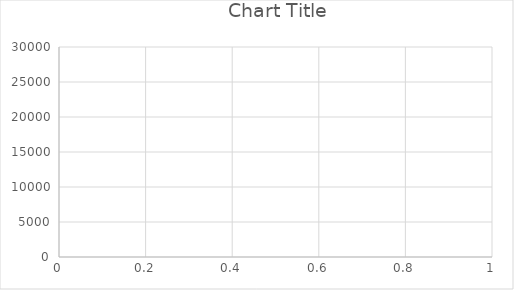
| Category | Series 0 |
|---|---|
| 0 | 7.311 |
| 1 | 4.989 |
| 2 | 3.975 |
| 3 | 108.128 |
| 4 | 89.555 |
| 5 | 74.954 |
| 6 | 64.622 |
| 7 | 58.103 |
| 8 | 440.562 |
| 9 | 396.65 |
| 10 | 360.752 |
| 11 | 330.891 |
| 12 | 305.546 |
| 13 | 283.875 |
| 14 | 272.303 |
| 15 | 255.418 |
| 16 | 240.505 |
| 17 | 228.195 |
| 18 | 223.236 |
| 19 | 212.188 |
| 20 | 203.521 |
| 21 | 194.389 |
| 22 | 185.996 |
| 23 | 178.289 |
| 24 | 177.979 |
| 25 | 171.371 |
| 26 | 165.078 |
| 27 | 159.52 |
| 28 | 154.261 |
| 29 | 149.266 |
| 30 | 144.552 |
| 31 | 154.583 |
| 32 | 149.931 |
| 33 | 145.576 |
| 34 | 141.526 |
| 35 | 137.635 |
| 36 | 134.292 |
| 37 | 130.86 |
| 38 | 130.37 |
| 39 | 127.332 |
| 40 | 124.267 |
| 41 | 121.337 |
| 42 | 118.684 |
| 43 | 121.255 |
| 44 | 118.795 |
| 45 | 116.708 |
| 46 | 114.247 |
| 47 | 112.064 |
| 48 | 109.801 |
| 49 | 107.712 |
| 50 | 105.642 |
| 51 | 103.631 |
| 52 | 101.716 |
| 53 | 99.902 |
| 54 | 98.112 |
| 55 | 96.504 |
| 56 | 94.835 |
| 57 | 93.311 |
| 58 | 91.882 |
| 59 | 90.407 |
| 60 | 88.973 |
| 61 | 87.57 |
| 62 | 86.514 |
| 63 | 85.178 |
| 64 | 83.9 |
| 65 | 82.671 |
| 66 | 81.509 |
| 67 | 80.355 |
| 68 | 79.24 |
| 69 | 78.16 |
| 70 | 77.084 |
| 71 | 76.052 |
| 72 | 75.665 |
| 73 | 74.677 |
| 74 | 74.039 |
| 75 | 73.282 |
| 76 | 72.404 |
| 77 | 71.525 |
| 78 | 70.782 |
| 79 | 69.95 |
| 80 | 69.116 |
| 81 | 68.288 |
| 82 | 67.657 |
| 83 | 66.867 |
| 84 | 66.232 |
| 85 | 65.553 |
| 86 | 64.831 |
| 87 | 64.128 |
| 88 | 63.641 |
| 89 | 63.099 |
| 90 | 62.477 |
| 91 | 62.039 |
| 92 | 61.47 |
| 93 | 60.86 |
| 94 | 65.11 |
| 95 | 64.551 |
| 96 | 64.017 |
| 97 | 66.038 |
| 98 | 65.385 |
| 99 | 64.775 |
| 100 | 64.151 |
| 101 | 63.592 |
| 102 | 63.093 |
| 103 | 62.522 |
| 104 | 62.035 |
| 105 | 61.498 |
| 106 | 61.001 |
| 107 | 61.023 |
| 108 | 60.498 |
| 109 | 60.057 |
| 110 | 59.588 |
| 111 | 59.081 |
| 112 | 58.639 |
| 113 | 58.15 |
| 114 | 57.655 |
| 115 | 57.257 |
| 116 | 56.78 |
| 117 | 57.996 |
| 118 | 57.586 |
| 119 | 57.149 |
| 120 | 56.688 |
| 121 | 56.235 |
| 122 | 55.788 |
| 123 | 85.157 |
| 124 | 84.54 |
| 125 | 84.016 |
| 126 | 83.398 |
| 127 | 82.939 |
| 128 | 82.44 |
| 129 | 81.852 |
| 130 | 81.401 |
| 131 | 80.81 |
| 132 | 80.247 |
| 133 | 84.47 |
| 134 | 149.108 |
| 135 | 148.024 |
| 136 | 146.952 |
| 137 | 145.9 |
| 138 | 144.995 |
| 139 | 143.971 |
| 140 | 142.957 |
| 141 | 142.41 |
| 142 | 141.428 |
| 143 | 140.487 |
| 144 | 139.742 |
| 145 | 138.896 |
| 146 | 137.995 |
| 147 | 137.073 |
| 148 | 136.167 |
| 149 | 135.267 |
| 150 | 153.898 |
| 151 | 152.893 |
| 152 | 151.901 |
| 153 | 150.921 |
| 154 | 150.011 |
| 155 | 149.064 |
| 156 | 148.127 |
| 157 | 147.201 |
| 158 | 146.306 |
| 159 | 145.416 |
| 160 | 144.519 |
| 161 | 143.725 |
| 162 | 144.482 |
| 163 | 143.624 |
| 164 | 146.421 |
| 165 | 148.007 |
| 166 | 1559.545 |
| 167 | 1550.277 |
| 168 | 1541.938 |
| 169 | 1533.062 |
| 170 | 1524.485 |
| 171 | 1515.633 |
| 172 | 1506.887 |
| 173 | 1499.493 |
| 174 | 1491.519 |
| 175 | 1483.113 |
| 176 | 1474.784 |
| 177 | 1467.159 |
| 178 | 1458.981 |
| 179 | 1450.938 |
| 180 | 1442.973 |
| 181 | 1435.05 |
| 182 | 1427.527 |
| 183 | 1419.792 |
| 184 | 1412.131 |
| 185 | 1404.618 |
| 186 | 1397.118 |
| 187 | 1389.692 |
| 188 | 1382.629 |
| 189 | 1375.357 |
| 190 | 1382.638 |
| 191 | 1375.492 |
| 192 | 1368.378 |
| 193 | 1361.331 |
| 194 | 1354.384 |
| 195 | 2205.536 |
| 196 | 2194.358 |
| 197 | 2183.314 |
| 198 | 2172.348 |
| 199 | 2161.493 |
| 200 | 2150.751 |
| 201 | 2142.897 |
| 202 | 2132.395 |
| 203 | 2121.947 |
| 204 | 2111.722 |
| 205 | 2101.488 |
| 206 | 2091.545 |
| 207 | 2084.589 |
| 208 | 2074.672 |
| 209 | 2064.893 |
| 210 | 2055.218 |
| 211 | 2045.926 |
| 212 | 2036.342 |
| 213 | 2026.907 |
| 214 | 2017.533 |
| 215 | 2008.219 |
| 216 | 1999.008 |
| 217 | 1989.865 |
| 218 | 1980.795 |
| 219 | 1971.88 |
| 220 | 1963.298 |
| 221 | 1954.461 |
| 222 | 1945.702 |
| 223 | 1937.046 |
| 224 | 1928.443 |
| 225 | 1919.968 |
| 226 | 1911.52 |
| 227 | 1903.145 |
| 228 | 1894.872 |
| 229 | 1886.639 |
| 230 | 1878.49 |
| 231 | 1870.473 |
| 232 | 1867.169 |
| 233 | 1859.204 |
| 234 | 1851.301 |
| 235 | 1843.462 |
| 236 | 1835.691 |
| 237 | 1827.984 |
| 238 | 1820.347 |
| 239 | 1812.78 |
| 240 | 1806.167 |
| 241 | 1798.715 |
| 242 | 1791.319 |
| 243 | 1788.265 |
| 244 | 1780.985 |
| 245 | 1773.749 |
| 246 | 1766.593 |
| 247 | 1759.48 |
| 248 | 1752.42 |
| 249 | 1745.507 |
| 250 | 1738.563 |
| 251 | 1732.445 |
| 252 | 1725.605 |
| 253 | 1718.864 |
| 254 | 1712.128 |
| 255 | 1705.444 |
| 256 | 1698.823 |
| 257 | 1692.242 |
| 258 | 1685.768 |
| 259 | 1679.323 |
| 260 | 1672.913 |
| 261 | 1666.534 |
| 262 | 1660.224 |
| 263 | 1654.006 |
| 264 | 1647.805 |
| 265 | 1641.62 |
| 266 | 1635.477 |
| 267 | 1629.38 |
| 268 | 1623.364 |
| 269 | 1617.359 |
| 270 | 1611.451 |
| 271 | 1606.916 |
| 272 | 1601.036 |
| 273 | 1595.209 |
| 274 | 1589.415 |
| 275 | 1583.883 |
| 276 | 1578.17 |
| 277 | 1572.498 |
| 278 | 1566.866 |
| 279 | 1561.977 |
| 280 | 1556.44 |
| 281 | 1550.926 |
| 282 | 1545.657 |
| 283 | 1540.219 |
| 284 | 1534.901 |
| 285 | 1529.587 |
| 286 | 1524.275 |
| 287 | 1518.987 |
| 288 | 1513.931 |
| 289 | 1508.73 |
| 290 | 1503.733 |
| 291 | 1498.593 |
| 292 | 1508.387 |
| 293 | 1503.337 |
| 294 | 1498.281 |
| 295 | 1493.54 |
| 296 | 1488.517 |
| 297 | 1483.86 |
| 298 | 1478.901 |
| 299 | 1473.977 |
| 300 | 1469.086 |
| 301 | 1466.045 |
| 302 | 1461.211 |
| 303 | 1456.426 |
| 304 | 1451.66 |
| 305 | 1446.921 |
| 306 | 1442.257 |
| 307 | 1437.586 |
| 308 | 1432.938 |
| 309 | 1428.32 |
| 310 | 1423.743 |
| 311 | 1419.183 |
| 312 | 1415.598 |
| 313 | 1411.094 |
| 314 | 1406.617 |
| 315 | 1402.224 |
| 316 | 1397.806 |
| 317 | 1394.397 |
| 318 | 1390.178 |
| 319 | 1385.838 |
| 320 | 1390.386 |
| 321 | 1386.092 |
| 322 | 1381.83 |
| 323 | 1377.57 |
| 324 | 1373.335 |
| 325 | 1369.172 |
| 326 | 1364.992 |
| 327 | 1360.833 |
| 328 | 1356.705 |
| 329 | 1352.6 |
| 330 | 1348.527 |
| 331 | 1344.468 |
| 332 | 1340.438 |
| 333 | 1337.719 |
| 334 | 1333.736 |
| 335 | 1329.771 |
| 336 | 1325.877 |
| 337 | 1321.962 |
| 338 | 1318.076 |
| 339 | 1314.217 |
| 340 | 1310.366 |
| 341 | 1306.542 |
| 342 | 1302.818 |
| 343 | 1299.035 |
| 344 | 1295.274 |
| 345 | 1291.535 |
| 346 | 1288.082 |
| 347 | 1284.413 |
| 348 | 1280.777 |
| 349 | 1277.503 |
| 350 | 1273.868 |
| 351 | 1270.304 |
| 352 | 1266.712 |
| 353 | 1263.144 |
| 354 | 1259.601 |
| 355 | 1256.073 |
| 356 | 1252.56 |
| 357 | 1249.099 |
| 358 | 1245.624 |
| 359 | 1242.203 |
| 360 | 1238.789 |
| 361 | 1235.483 |
| 362 | 1232.085 |
| 363 | 1228.705 |
| 364 | 1225.916 |
| 365 | 1222.664 |
| 366 | 1219.341 |
| 367 | 1216.059 |
| 368 | 1212.851 |
| 369 | 1209.593 |
| 370 | 1206.593 |
| 371 | 1203.355 |
| 372 | 1200.189 |
| 373 | 1197.078 |
| 374 | 1193.932 |
| 375 | 1190.76 |
| 376 | 1187.612 |
| 377 | 1184.489 |
| 378 | 1181.368 |
| 379 | 1178.262 |
| 380 | 1183.628 |
| 381 | 1180.677 |
| 382 | 1179.042 |
| 383 | 1175.996 |
| 384 | 1172.944 |
| 385 | 1169.912 |
| 386 | 1166.891 |
| 387 | 1163.984 |
| 388 | 1161.02 |
| 389 | 1158.049 |
| 390 | 1155.094 |
| 391 | 1152.193 |
| 392 | 1149.279 |
| 393 | 1146.366 |
| 394 | 1143.471 |
| 395 | 1140.587 |
| 396 | 1137.82 |
| 397 | 1134.969 |
| 398 | 1132.131 |
| 399 | 1129.398 |
| 400 | 1126.621 |
| 401 | 1123.822 |
| 402 | 1121.037 |
| 403 | 1118.277 |
| 404 | 1115.582 |
| 405 | 1112.848 |
| 406 | 1110.153 |
| 407 | 1109.232 |
| 408 | 1106.526 |
| 409 | 1103.83 |
| 410 | 1101.153 |
| 411 | 1098.576 |
| 412 | 1095.919 |
| 413 | 1093.454 |
| 414 | 1092.799 |
| 415 | 1090.176 |
| 416 | 1087.579 |
| 417 | 1084.981 |
| 418 | 1082.394 |
| 419 | 1079.844 |
| 420 | 1081.651 |
| 421 | 1079.119 |
| 422 | 1081.679 |
| 423 | 1079.32 |
| 424 | 1077.117 |
| 425 | 1074.608 |
| 426 | 1072.115 |
| 427 | 1069.617 |
| 428 | 1067.135 |
| 429 | 1064.658 |
| 430 | 1062.197 |
| 431 | 1059.771 |
| 432 | 1057.328 |
| 433 | 1054.895 |
| 434 | 1052.475 |
| 435 | 1050.067 |
| 436 | 1049.783 |
| 437 | 1047.39 |
| 438 | 1045.008 |
| 439 | 1042.637 |
| 440 | 1040.278 |
| 441 | 1037.929 |
| 442 | 1035.59 |
| 443 | 1033.353 |
| 444 | 1031.061 |
| 445 | 1029.022 |
| 446 | 1032.24 |
| 447 | 1032.161 |
| 448 | 1029.873 |
| 449 | 1027.588 |
| 450 | 1025.314 |
| 451 | 1023.048 |
| 452 | 1020.816 |
| 453 | 1018.573 |
| 454 | 1016.346 |
| 455 | 1014.129 |
| 456 | 1011.913 |
| 457 | 1009.748 |
| 458 | 1008.018 |
| 459 | 1005.83 |
| 460 | 1003.654 |
| 461 | 1001.556 |
| 462 | 999.403 |
| 463 | 997.306 |
| 464 | 995.164 |
| 465 | 993.034 |
| 466 | 990.91 |
| 467 | 988.807 |
| 468 | 986.702 |
| 469 | 984.607 |
| 470 | 982.798 |
| 471 | 980.746 |
| 472 | 978.703 |
| 473 | 977.045 |
| 474 | 975.023 |
| 475 | 972.977 |
| 476 | 970.96 |
| 477 | 968.934 |
| 478 | 966.94 |
| 479 | 964.936 |
| 480 | 962.933 |
| 481 | 960.957 |
| 482 | 958.971 |
| 483 | 962.669 |
| 484 | 960.688 |
| 485 | 958.73 |
| 486 | 956.853 |
| 487 | 954.896 |
| 488 | 952.959 |
| 489 | 951.05 |
| 490 | 949.301 |
| 491 | 947.387 |
| 492 | 945.489 |
| 493 | 943.579 |
| 494 | 941.68 |
| 495 | 939.794 |
| 496 | 937.908 |
| 497 | 936.028 |
| 498 | 934.52 |
| 499 | 935.283 |
| 500 | 933.42 |
| 501 | 931.578 |
| 502 | 930.356 |
| 503 | 929.032 |
| 504 | 927.212 |
| 505 | 925.384 |
| 506 | 923.768 |
| 507 | 921.952 |
| 508 | 920.199 |
| 509 | 918.579 |
| 510 | 916.784 |
| 511 | 915.157 |
| 512 | 913.383 |
| 513 | 911.636 |
| 514 | 909.9 |
| 515 | 908.139 |
| 516 | 906.409 |
| 517 | 904.814 |
| 518 | 931.233 |
| 519 | 929.77 |
| 520 | 927.989 |
| 521 | 926.214 |
| 522 | 924.449 |
| 523 | 922.766 |
| 524 | 921.01 |
| 525 | 919.263 |
| 526 | 920.787 |
| 527 | 919.045 |
| 528 | 917.354 |
| 529 | 917.157 |
| 530 | 915.447 |
| 531 | 913.728 |
| 532 | 912.016 |
| 533 | 910.794 |
| 534 | 909.12 |
| 535 | 907.521 |
| 536 | 905.837 |
| 537 | 904.2 |
| 538 | 902.583 |
| 539 | 900.924 |
| 540 | 899.262 |
| 541 | 897.627 |
| 542 | 904.418 |
| 543 | 902.763 |
| 544 | 901.109 |
| 545 | 899.46 |
| 546 | 897.869 |
| 547 | 896.236 |
| 548 | 894.605 |
| 549 | 893.008 |
| 550 | 891.391 |
| 551 | 889.778 |
| 552 | 888.173 |
| 553 | 886.586 |
| 554 | 885.003 |
| 555 | 883.414 |
| 556 | 881.834 |
| 557 | 880.971 |
| 558 | 880.063 |
| 559 | 878.497 |
| 560 | 876.938 |
| 561 | 875.381 |
| 562 | 873.852 |
| 563 | 872.325 |
| 564 | 870.855 |
| 565 | 869.54 |
| 566 | 868.199 |
| 567 | 866.674 |
| 568 | 865.153 |
| 569 | 863.64 |
| 570 | 862.179 |
| 571 | 860.674 |
| 572 | 859.176 |
| 573 | 857.696 |
| 574 | 856.301 |
| 575 | 854.927 |
| 576 | 853.449 |
| 577 | 851.996 |
| 578 | 850.533 |
| 579 | 849.07 |
| 580 | 847.613 |
| 581 | 846.16 |
| 582 | 844.711 |
| 583 | 843.267 |
| 584 | 841.83 |
| 585 | 840.727 |
| 586 | 839.305 |
| 587 | 837.896 |
| 588 | 836.479 |
| 589 | 835.067 |
| 590 | 833.656 |
| 591 | 832.252 |
| 592 | 830.851 |
| 593 | 829.545 |
| 594 | 828.158 |
| 595 | 826.772 |
| 596 | 825.39 |
| 597 | 824.046 |
| 598 | 822.673 |
| 599 | 821.318 |
| 600 | 819.955 |
| 601 | 818.614 |
| 602 | 817.288 |
| 603 | 815.937 |
| 604 | 814.611 |
| 605 | 813.293 |
| 606 | 811.959 |
| 607 | 810.637 |
| 608 | 809.33 |
| 609 | 808.005 |
| 610 | 806.686 |
| 611 | 805.371 |
| 612 | 804.06 |
| 613 | 802.753 |
| 614 | 801.623 |
| 615 | 800.337 |
| 616 | 799.042 |
| 617 | 797.756 |
| 618 | 796.471 |
| 619 | 795.191 |
| 620 | 793.912 |
| 621 | 792.669 |
| 622 | 791.399 |
| 623 | 790.132 |
| 624 | 788.872 |
| 625 | 787.79 |
| 626 | 786.704 |
| 627 | 785.468 |
| 628 | 784.255 |
| 629 | 783.013 |
| 630 | 790.086 |
| 631 | 788.853 |
| 632 | 787.628 |
| 633 | 786.388 |
| 634 | 785.168 |
| 635 | 783.936 |
| 636 | 782.711 |
| 637 | 781.784 |
| 638 | 780.563 |
| 639 | 779.347 |
| 640 | 778.187 |
| 641 | 776.977 |
| 642 | 775.772 |
| 643 | 774.58 |
| 644 | 773.485 |
| 645 | 772.293 |
| 646 | 771.1 |
| 647 | 769.959 |
| 648 | 768.834 |
| 649 | 767.674 |
| 650 | 766.538 |
| 651 | 765.467 |
| 652 | 764.299 |
| 653 | 763.133 |
| 654 | 761.971 |
| 655 | 760.812 |
| 656 | 759.666 |
| 657 | 758.518 |
| 658 | 757.369 |
| 659 | 756.225 |
| 660 | 755.083 |
| 661 | 753.944 |
| 662 | 752.814 |
| 663 | 751.683 |
| 664 | 750.556 |
| 665 | 749.515 |
| 666 | 748.396 |
| 667 | 747.284 |
| 668 | 747.916 |
| 669 | 746.804 |
| 670 | 745.743 |
| 671 | 745.38 |
| 672 | 744.297 |
| 673 | 743.199 |
| 674 | 742.105 |
| 675 | 741.012 |
| 676 | 739.921 |
| 677 | 738.883 |
| 678 | 737.803 |
| 679 | 736.76 |
| 680 | 735.685 |
| 681 | 734.612 |
| 682 | 733.538 |
| 683 | 732.47 |
| 684 | 731.403 |
| 685 | 730.34 |
| 686 | 729.293 |
| 687 | 728.249 |
| 688 | 727.196 |
| 689 | 726.144 |
| 690 | 725.119 |
| 691 | 724.074 |
| 692 | 726.978 |
| 693 | 725.933 |
| 694 | 724.89 |
| 695 | 723.852 |
| 696 | 723.095 |
| 697 | 722.067 |
| 698 | 721.144 |
| 699 | 720.116 |
| 700 | 719.808 |
| 701 | 718.784 |
| 702 | 717.778 |
| 703 | 716.768 |
| 704 | 715.753 |
| 705 | 714.793 |
| 706 | 713.785 |
| 707 | 712.779 |
| 708 | 711.779 |
| 709 | 711.31 |
| 710 | 710.319 |
| 711 | 709.323 |
| 712 | 708.533 |
| 713 | 707.604 |
| 714 | 706.617 |
| 715 | 705.633 |
| 716 | 704.665 |
| 717 | 703.706 |
| 718 | 702.73 |
| 719 | 701.756 |
| 720 | 700.785 |
| 721 | 699.827 |
| 722 | 698.875 |
| 723 | 697.911 |
| 724 | 696.951 |
| 725 | 695.996 |
| 726 | 695.04 |
| 727 | 694.092 |
| 728 | 693.146 |
| 729 | 693.347 |
| 730 | 692.402 |
| 731 | 691.722 |
| 732 | 691.376 |
| 733 | 690.437 |
| 734 | 689.514 |
| 735 | 688.579 |
| 736 | 687.884 |
| 737 | 686.968 |
| 738 | 686.04 |
| 739 | 685.116 |
| 740 | 684.197 |
| 741 | 683.282 |
| 742 | 682.364 |
| 743 | 681.573 |
| 744 | 680.68 |
| 745 | 679.871 |
| 746 | 678.962 |
| 747 | 678.062 |
| 748 | 677.182 |
| 749 | 676.628 |
| 750 | 675.729 |
| 751 | 674.834 |
| 752 | 675.054 |
| 753 | 676.037 |
| 754 | 675.144 |
| 755 | 675.156 |
| 756 | 674.265 |
| 757 | 673.381 |
| 758 | 682.667 |
| 759 | 681.776 |
| 760 | 680.882 |
| 761 | 679.992 |
| 762 | 679.106 |
| 763 | 678.69 |
| 764 | 677.805 |
| 765 | 676.922 |
| 766 | 676.041 |
| 767 | 675.167 |
| 768 | 674.291 |
| 769 | 673.472 |
| 770 | 672.603 |
| 771 | 672.966 |
| 772 | 672.1 |
| 773 | 671.234 |
| 774 | 670.875 |
| 775 | 670.013 |
| 776 | 669.16 |
| 777 | 668.306 |
| 778 | 667.452 |
| 779 | 666.623 |
| 780 | 665.771 |
| 781 | 664.924 |
| 782 | 664.077 |
| 783 | 663.235 |
| 784 | 662.403 |
| 785 | 661.566 |
| 786 | 660.728 |
| 787 | 659.891 |
| 788 | 659.058 |
| 789 | 658.24 |
| 790 | 657.41 |
| 791 | 656.587 |
| 792 | 655.771 |
| 793 | 654.947 |
| 794 | 654.138 |
| 795 | 653.364 |
| 796 | 652.715 |
| 797 | 651.914 |
| 798 | 651.12 |
| 799 | 650.309 |
| 800 | 649.503 |
| 801 | 648.711 |
| 802 | 647.905 |
| 803 | 647.102 |
| 804 | 646.304 |
| 805 | 645.504 |
| 806 | 644.706 |
| 807 | 643.91 |
| 808 | 643.118 |
| 809 | 642.332 |
| 810 | 641.664 |
| 811 | 640.916 |
| 812 | 645.853 |
| 813 | 645.062 |
| 814 | 644.274 |
| 815 | 643.489 |
| 816 | 642.719 |
| 817 | 642.024 |
| 818 | 641.246 |
| 819 | 640.472 |
| 820 | 639.709 |
| 821 | 638.934 |
| 822 | 638.171 |
| 823 | 637.398 |
| 824 | 636.64 |
| 825 | 635.873 |
| 826 | 635.106 |
| 827 | 634.342 |
| 828 | 633.685 |
| 829 | 632.932 |
| 830 | 632.172 |
| 831 | 631.416 |
| 832 | 630.688 |
| 833 | 629.934 |
| 834 | 629.182 |
| 835 | 628.431 |
| 836 | 627.686 |
| 837 | 626.939 |
| 838 | 626.195 |
| 839 | 625.451 |
| 840 | 624.713 |
| 841 | 623.976 |
| 842 | 623.281 |
| 843 | 622.55 |
| 844 | 621.815 |
| 845 | 621.082 |
| 846 | 620.356 |
| 847 | 619.654 |
| 848 | 618.926 |
| 849 | 618.2 |
| 850 | 617.483 |
| 851 | 616.761 |
| 852 | 616.039 |
| 853 | 615.321 |
| 854 | 614.602 |
| 855 | 613.886 |
| 856 | 613.181 |
| 857 | 612.468 |
| 858 | 611.805 |
| 859 | 611.099 |
| 860 | 610.417 |
| 861 | 609.711 |
| 862 | 609.006 |
| 863 | 608.303 |
| 864 | 607.604 |
| 865 | 606.947 |
| 866 | 606.249 |
| 867 | 605.556 |
| 868 | 604.863 |
| 869 | 604.17 |
| 870 | 603.48 |
| 871 | 602.889 |
| 872 | 602.204 |
| 873 | 601.58 |
| 874 | 600.899 |
| 875 | 600.215 |
| 876 | 599.536 |
| 877 | 598.858 |
| 878 | 598.21 |
| 879 | 597.535 |
| 880 | 596.864 |
| 881 | 596.189 |
| 882 | 595.516 |
| 883 | 594.845 |
| 884 | 594.186 |
| 885 | 594.338 |
| 886 | 593.669 |
| 887 | 593.002 |
| 888 | 592.337 |
| 889 | 591.684 |
| 890 | 591.023 |
| 891 | 590.372 |
| 892 | 589.715 |
| 893 | 609.168 |
| 894 | 608.49 |
| 895 | 607.82 |
| 896 | 607.263 |
| 897 | 606.59 |
| 898 | 605.925 |
| 899 | 605.268 |
| 900 | 604.626 |
| 901 | 603.957 |
| 902 | 603.289 |
| 903 | 602.624 |
| 904 | 601.962 |
| 905 | 601.301 |
| 906 | 600.723 |
| 907 | 600.068 |
| 908 | 599.409 |
| 909 | 598.752 |
| 910 | 598.155 |
| 911 | 597.513 |
| 912 | 596.86 |
| 913 | 596.209 |
| 914 | 595.56 |
| 915 | 594.911 |
| 916 | 594.264 |
| 917 | 593.618 |
| 918 | 592.974 |
| 919 | 592.375 |
| 920 | 591.733 |
| 921 | 591.092 |
| 922 | 590.46 |
| 923 | 589.823 |
| 924 | 589.317 |
| 925 | 598.728 |
| 926 | 598.12 |
| 927 | 597.507 |
| 928 | 596.865 |
| 929 | 596.229 |
| 930 | 595.59 |
| 931 | 594.953 |
| 932 | 596.397 |
| 933 | 595.762 |
| 934 | 595.128 |
| 935 | 594.493 |
| 936 | 593.884 |
| 937 | 593.255 |
| 938 | 592.625 |
| 939 | 596.105 |
| 940 | 595.685 |
| 941 | 595.056 |
| 942 | 594.432 |
| 943 | 593.805 |
| 944 | 593.181 |
| 945 | 592.557 |
| 946 | 591.932 |
| 947 | 591.309 |
| 948 | 590.975 |
| 949 | 590.357 |
| 950 | 589.742 |
| 951 | 589.13 |
| 952 | 588.516 |
| 953 | 587.902 |
| 954 | 587.288 |
| 955 | 586.683 |
| 956 | 586.071 |
| 957 | 585.547 |
| 958 | 584.942 |
| 959 | 584.335 |
| 960 | 583.731 |
| 961 | 583.133 |
| 962 | 582.529 |
| 963 | 581.927 |
| 964 | 581.325 |
| 965 | 580.726 |
| 966 | 580.133 |
| 967 | 579.768 |
| 968 | 579.172 |
| 969 | 578.646 |
| 970 | 578.119 |
| 971 | 577.538 |
| 972 | 576.946 |
| 973 | 576.39 |
| 974 | 575.8 |
| 975 | 575.213 |
| 976 | 574.629 |
| 977 | 574.043 |
| 978 | 573.462 |
| 979 | 572.878 |
| 980 | 572.299 |
| 981 | 571.72 |
| 982 | 571.169 |
| 983 | 570.591 |
| 984 | 570.016 |
| 985 | 569.441 |
| 986 | 568.875 |
| 987 | 568.304 |
| 988 | 567.734 |
| 989 | 567.164 |
| 990 | 566.593 |
| 991 | 566.025 |
| 992 | 565.462 |
| 993 | 564.902 |
| 994 | 564.336 |
| 995 | 563.771 |
| 996 | 563.213 |
| 997 | 562.661 |
| 998 | 562.099 |
| 999 | 561.54 |
| 1000 | 560.98 |
| 1001 | 560.422 |
| 1002 | 559.864 |
| 1003 | 559.31 |
| 1004 | 558.784 |
| 1005 | 558.23 |
| 1006 | 557.679 |
| 1007 | 557.127 |
| 1008 | 556.576 |
| 1009 | 556.026 |
| 1010 | 555.478 |
| 1011 | 554.942 |
| 1012 | 554.407 |
| 1013 | 553.92 |
| 1014 | 553.383 |
| 1015 | 552.842 |
| 1016 | 552.305 |
| 1017 | 551.984 |
| 1018 | 551.446 |
| 1019 | 551.409 |
| 1020 | 550.871 |
| 1021 | 550.34 |
| 1022 | 549.804 |
| 1023 | 549.272 |
| 1024 | 548.742 |
| 1025 | 548.305 |
| 1026 | 547.81 |
| 1027 | 547.279 |
| 1028 | 546.777 |
| 1029 | 546.252 |
| 1030 | 545.724 |
| 1031 | 545.196 |
| 1032 | 544.67 |
| 1033 | 544.145 |
| 1034 | 543.621 |
| 1035 | 543.098 |
| 1036 | 543.078 |
| 1037 | 542.558 |
| 1038 | 542.037 |
| 1039 | 541.608 |
| 1040 | 541.092 |
| 1041 | 540.582 |
| 1042 | 540.065 |
| 1043 | 539.554 |
| 1044 | 539.041 |
| 1045 | 538.532 |
| 1046 | 544.351 |
| 1047 | 543.834 |
| 1048 | 543.333 |
| 1049 | 542.828 |
| 1050 | 542.313 |
| 1051 | 541.798 |
| 1052 | 541.285 |
| 1053 | 540.788 |
| 1054 | 540.311 |
| 1055 | 539.802 |
| 1056 | 539.292 |
| 1057 | 538.784 |
| 1058 | 538.276 |
| 1059 | 537.77 |
| 1060 | 537.266 |
| 1061 | 536.762 |
| 1062 | 536.262 |
| 1063 | 535.762 |
| 1064 | 535.321 |
| 1065 | 534.821 |
| 1066 | 534.337 |
| 1067 | 533.843 |
| 1068 | 533.345 |
| 1069 | 532.855 |
| 1070 | 532.359 |
| 1071 | 531.865 |
| 1072 | 531.373 |
| 1073 | 530.914 |
| 1074 | 530.421 |
| 1075 | 529.93 |
| 1076 | 529.47 |
| 1077 | 528.981 |
| 1078 | 528.502 |
| 1079 | 528.014 |
| 1080 | 527.528 |
| 1081 | 527.042 |
| 1082 | 526.646 |
| 1083 | 526.175 |
| 1084 | 525.691 |
| 1085 | 525.208 |
| 1086 | 524.728 |
| 1087 | 524.247 |
| 1088 | 523.768 |
| 1089 | 523.292 |
| 1090 | 522.813 |
| 1091 | 522.614 |
| 1092 | 522.137 |
| 1093 | 521.661 |
| 1094 | 521.189 |
| 1095 | 520.715 |
| 1096 | 520.242 |
| 1097 | 519.781 |
| 1098 | 519.316 |
| 1099 | 518.855 |
| 1100 | 518.386 |
| 1101 | 517.931 |
| 1102 | 517.465 |
| 1103 | 520.003 |
| 1104 | 519.533 |
| 1105 | 519.065 |
| 1106 | 518.6 |
| 1107 | 518.179 |
| 1108 | 518.433 |
| 1109 | 517.969 |
| 1110 | 517.505 |
| 1111 | 517.05 |
| 1112 | 516.601 |
| 1113 | 516.306 |
| 1114 | 515.93 |
| 1115 | 515.474 |
| 1116 | 515.016 |
| 1117 | 514.557 |
| 1118 | 514.106 |
| 1119 | 513.648 |
| 1120 | 513.192 |
| 1121 | 512.736 |
| 1122 | 512.28 |
| 1123 | 511.86 |
| 1124 | 511.407 |
| 1125 | 510.955 |
| 1126 | 510.502 |
| 1127 | 510.051 |
| 1128 | 509.6 |
| 1129 | 509.152 |
| 1130 | 508.704 |
| 1131 | 508.257 |
| 1132 | 507.836 |
| 1133 | 507.391 |
| 1134 | 506.947 |
| 1135 | 506.504 |
| 1136 | 506.062 |
| 1137 | 505.618 |
| 1138 | 505.175 |
| 1139 | 504.828 |
| 1140 | 504.402 |
| 1141 | 503.97 |
| 1142 | 503.53 |
| 1143 | 503.098 |
| 1144 | 502.664 |
| 1145 | 502.23 |
| 1146 | 501.799 |
| 1147 | 501.793 |
| 1148 | 501.358 |
| 1149 | 500.923 |
| 1150 | 500.489 |
| 1151 | 500.114 |
| 1152 | 499.682 |
| 1153 | 499.271 |
| 1154 | 498.841 |
| 1155 | 498.411 |
| 1156 | 497.991 |
| 1157 | 497.562 |
| 1158 | 497.217 |
| 1159 | 496.794 |
| 1160 | 496.367 |
| 1161 | 495.941 |
| 1162 | 495.517 |
| 1163 | 495.092 |
| 1164 | 494.688 |
| 1165 | 494.265 |
| 1166 | 493.843 |
| 1167 | 493.426 |
| 1168 | 493.095 |
| 1169 | 492.675 |
| 1170 | 492.255 |
| 1171 | 492.034 |
| 1172 | 491.629 |
| 1173 | 491.211 |
| 1174 | 490.8 |
| 1175 | 490.392 |
| 1176 | 489.977 |
| 1177 | 489.563 |
| 1178 | 489.149 |
| 1179 | 488.742 |
| 1180 | 488.33 |
| 1181 | 487.92 |
| 1182 | 487.509 |
| 1183 | 487.103 |
| 1184 | 486.694 |
| 1185 | 486.286 |
| 1186 | 485.901 |
| 1187 | 485.493 |
| 1188 | 485.087 |
| 1189 | 484.693 |
| 1190 | 484.306 |
| 1191 | 483.902 |
| 1192 | 483.5 |
| 1193 | 483.108 |
| 1194 | 482.886 |
| 1195 | 482.689 |
| 1196 | 482.29 |
| 1197 | 481.892 |
| 1198 | 481.493 |
| 1199 | 481.094 |
| 1200 | 480.699 |
| 1201 | 480.3 |
| 1202 | 479.903 |
| 1203 | 479.505 |
| 1204 | 479.139 |
| 1205 | 478.743 |
| 1206 | 478.347 |
| 1207 | 477.954 |
| 1208 | 477.56 |
| 1209 | 477.173 |
| 1210 | 476.812 |
| 1211 | 476.42 |
| 1212 | 476.032 |
| 1213 | 475.652 |
| 1214 | 475.265 |
| 1215 | 474.881 |
| 1216 | 474.494 |
| 1217 | 474.106 |
| 1218 | 473.718 |
| 1219 | 473.332 |
| 1220 | 472.946 |
| 1221 | 474.72 |
| 1222 | 474.352 |
| 1223 | 1415.337 |
| 1224 | 1414.183 |
| 1225 | 1413.038 |
| 1226 | 1411.888 |
| 1227 | 1410.744 |
| 1228 | 1409.599 |
| 1229 | 1408.455 |
| 1230 | 1407.313 |
| 1231 | 1406.202 |
| 1232 | 1405.066 |
| 1233 | 1403.929 |
| 1234 | 1402.793 |
| 1235 | 1401.806 |
| 1236 | 1420.737 |
| 1237 | 1419.59 |
| 1238 | 1418.448 |
| 1239 | 1417.31 |
| 1240 | 1416.181 |
| 1241 | 1415.051 |
| 1242 | 1413.914 |
| 1243 | 1412.778 |
| 1244 | 1411.839 |
| 1245 | 1410.708 |
| 1246 | 1409.577 |
| 1247 | 1408.523 |
| 1248 | 1407.396 |
| 1249 | 1406.347 |
| 1250 | 1405.769 |
| 1251 | 1404.649 |
| 1252 | 1403.545 |
| 1253 | 1402.427 |
| 1254 | 1401.314 |
| 1255 | 1400.199 |
| 1256 | 1399.086 |
| 1257 | 1397.988 |
| 1258 | 1396.879 |
| 1259 | 1395.772 |
| 1260 | 1394.666 |
| 1261 | 1393.6 |
| 1262 | 1392.578 |
| 1263 | 1391.478 |
| 1264 | 1390.381 |
| 1265 | 1389.284 |
| 1266 | 1388.189 |
| 1267 | 1387.11 |
| 1268 | 1386.025 |
| 1269 | 1384.941 |
| 1270 | 1383.855 |
| 1271 | 1382.79 |
| 1272 | 1381.705 |
| 1273 | 1381.253 |
| 1274 | 1380.173 |
| 1275 | 1379.094 |
| 1276 | 1378.021 |
| 1277 | 1376.95 |
| 1278 | 1375.874 |
| 1279 | 1374.822 |
| 1280 | 1374.08 |
| 1281 | 1373.014 |
| 1282 | 1371.962 |
| 1283 | 1370.894 |
| 1284 | 1369.829 |
| 1285 | 1368.771 |
| 1286 | 1367.709 |
| 1287 | 1366.655 |
| 1288 | 1365.598 |
| 1289 | 1364.55 |
| 1290 | 1363.52 |
| 1291 | 1362.468 |
| 1292 | 1361.416 |
| 1293 | 1360.856 |
| 1294 | 1359.823 |
| 1295 | 1358.776 |
| 1296 | 1357.729 |
| 1297 | 1356.685 |
| 1298 | 1355.642 |
| 1299 | 1354.602 |
| 1300 | 1353.562 |
| 1301 | 1352.538 |
| 1302 | 1351.502 |
| 1303 | 1352.602 |
| 1304 | 1351.567 |
| 1305 | 1350.536 |
| 1306 | 1349.504 |
| 1307 | 1348.477 |
| 1308 | 1347.452 |
| 1309 | 1346.425 |
| 1310 | 1345.527 |
| 1311 | 1344.503 |
| 1312 | 1725.766 |
| 1313 | 1724.454 |
| 1314 | 1723.146 |
| 1315 | 1721.837 |
| 1316 | 1720.54 |
| 1317 | 1719.236 |
| 1318 | 1717.945 |
| 1319 | 1716.646 |
| 1320 | 1715.349 |
| 1321 | 1714.053 |
| 1322 | 1712.759 |
| 1323 | 1711.474 |
| 1324 | 1710.193 |
| 1325 | 1708.904 |
| 1326 | 1707.618 |
| 1327 | 1706.334 |
| 1328 | 1705.052 |
| 1329 | 1703.777 |
| 1330 | 1702.498 |
| 1331 | 1701.222 |
| 1332 | 1699.948 |
| 1333 | 1698.677 |
| 1334 | 1697.43 |
| 1335 | 1696.205 |
| 1336 | 1694.939 |
| 1337 | 1693.679 |
| 1338 | 1692.433 |
| 1339 | 1691.171 |
| 1340 | 1689.93 |
| 1341 | 1688.676 |
| 1342 | 1687.422 |
| 1343 | 1686.169 |
| 1344 | 1684.992 |
| 1345 | 1683.741 |
| 1346 | 1682.495 |
| 1347 | 1681.249 |
| 1348 | 1680.004 |
| 1349 | 1678.816 |
| 1350 | 1677.575 |
| 1351 | 1676.34 |
| 1352 | 1680.598 |
| 1353 | 1679.36 |
| 1354 | 1678.122 |
| 1355 | 1676.885 |
| 1356 | 1675.652 |
| 1357 | 1674.419 |
| 1358 | 1673.217 |
| 1359 | 1671.99 |
| 1360 | 1670.8 |
| 1361 | 1669.576 |
| 1362 | 1668.373 |
| 1363 | 1667.151 |
| 1364 | 1665.934 |
| 1365 | 1664.737 |
| 1366 | 1663.52 |
| 1367 | 1662.308 |
| 1368 | 1661.095 |
| 1369 | 1659.887 |
| 1370 | 1658.812 |
| 1371 | 1657.605 |
| 1372 | 1656.4 |
| 1373 | 1655.195 |
| 1374 | 1653.993 |
| 1375 | 1652.792 |
| 1376 | 1651.598 |
| 1377 | 1650.401 |
| 1378 | 1649.206 |
| 1379 | 1648.012 |
| 1380 | 1650.969 |
| 1381 | 1649.776 |
| 1382 | 1648.586 |
| 1383 | 1647.413 |
| 1384 | 1646.233 |
| 1385 | 1645.05 |
| 1386 | 1643.93 |
| 1387 | 1656.276 |
| 1388 | 1655.084 |
| 1389 | 1653.895 |
| 1390 | 1652.709 |
| 1391 | 1651.522 |
| 1392 | 1650.344 |
| 1393 | 1649.161 |
| 1394 | 1647.98 |
| 1395 | 1730.133 |
| 1396 | 1728.895 |
| 1397 | 1727.659 |
| 1398 | 1726.425 |
| 1399 | 1725.193 |
| 1400 | 1723.963 |
| 1401 | 1722.735 |
| 1402 | 1721.511 |
| 1403 | 1720.286 |
| 1404 | 1719.07 |
| 1405 | 1717.848 |
| 1406 | 1716.629 |
| 1407 | 1715.418 |
| 1408 | 1714.202 |
| 1409 | 1713.183 |
| 1410 | 1713.364 |
| 1411 | 1712.263 |
| 1412 | 1711.052 |
| 1413 | 1709.856 |
| 1414 | 1708.65 |
| 1415 | 1707.447 |
| 1416 | 1706.303 |
| 1417 | 1705.101 |
| 1418 | 1703.901 |
| 1419 | 1702.703 |
| 1420 | 1701.519 |
| 1421 | 1700.393 |
| 1422 | 1699.206 |
| 1423 | 1698.015 |
| 1424 | 1696.825 |
| 1425 | 1695.636 |
| 1426 | 1694.456 |
| 1427 | 1693.274 |
| 1428 | 1692.091 |
| 1429 | 1690.92 |
| 1430 | 1689.742 |
| 1431 | 1688.563 |
| 1432 | 1687.386 |
| 1433 | 1686.217 |
| 1434 | 1685.045 |
| 1435 | 1683.873 |
| 1436 | 1682.702 |
| 1437 | 1681.533 |
| 1438 | 1680.392 |
| 1439 | 1679.23 |
| 1440 | 1678.068 |
| 1441 | 1676.905 |
| 1442 | 1675.757 |
| 1443 | 1674.711 |
| 1444 | 1673.553 |
| 1445 | 1672.397 |
| 1446 | 1671.242 |
| 1447 | 1671.038 |
| 1448 | 1669.886 |
| 1449 | 1668.74 |
| 1450 | 1667.599 |
| 1451 | 1666.452 |
| 1452 | 1665.308 |
| 1453 | 1664.217 |
| 1454 | 1663.074 |
| 1455 | 1661.933 |
| 1456 | 1660.793 |
| 1457 | 1659.663 |
| 1458 | 1658.531 |
| 1459 | 1657.424 |
| 1460 | 1656.292 |
| 1461 | 1655.161 |
| 1462 | 1654.064 |
| 1463 | 1652.939 |
| 1464 | 1651.812 |
| 1465 | 1650.753 |
| 1466 | 1649.628 |
| 1467 | 1648.517 |
| 1468 | 1647.397 |
| 1469 | 1646.293 |
| 1470 | 1645.175 |
| 1471 | 1644.066 |
| 1472 | 1642.951 |
| 1473 | 1641.837 |
| 1474 | 1640.739 |
| 1475 | 1639.629 |
| 1476 | 1638.904 |
| 1477 | 1637.796 |
| 1478 | 1636.7 |
| 1479 | 1635.597 |
| 1480 | 1634.494 |
| 1481 | 1633.393 |
| 1482 | 1632.327 |
| 1483 | 1631.231 |
| 1484 | 1630.134 |
| 1485 | 1629.038 |
| 1486 | 1627.952 |
| 1487 | 1627.005 |
| 1488 | 1625.914 |
| 1489 | 1624.826 |
| 1490 | 1623.738 |
| 1491 | 1622.667 |
| 1492 | 1621.581 |
| 1493 | 1620.497 |
| 1494 | 1620.926 |
| 1495 | 1619.903 |
| 1496 | 1618.823 |
| 1497 | 1617.743 |
| 1498 | 1616.666 |
| 1499 | 1615.59 |
| 1500 | 1614.516 |
| 1501 | 1613.441 |
| 1502 | 1612.369 |
| 1503 | 1611.297 |
| 1504 | 1610.227 |
| 1505 | 1609.161 |
| 1506 | 1608.096 |
| 1507 | 1607.033 |
| 1508 | 1605.971 |
| 1509 | 1604.909 |
| 1510 | 1603.848 |
| 1511 | 1603.066 |
| 1512 | 1602.116 |
| 1513 | 1601.065 |
| 1514 | 1600.067 |
| 1515 | 1599.014 |
| 1516 | 1597.977 |
| 1517 | 1596.929 |
| 1518 | 1596.734 |
| 1519 | 1595.687 |
| 1520 | 1594.639 |
| 1521 | 1593.592 |
| 1522 | 1592.549 |
| 1523 | 1591.508 |
| 1524 | 1590.465 |
| 1525 | 1590.685 |
| 1526 | 1589.645 |
| 1527 | 1588.605 |
| 1528 | 1587.572 |
| 1529 | 1586.536 |
| 1530 | 1585.508 |
| 1531 | 1585.008 |
| 1532 | 1584.03 |
| 1533 | 1582.998 |
| 1534 | 1581.968 |
| 1535 | 1580.939 |
| 1536 | 1579.913 |
| 1537 | 1578.886 |
| 1538 | 1577.862 |
| 1539 | 1576.838 |
| 1540 | 1575.824 |
| 1541 | 1574.805 |
| 1542 | 1573.785 |
| 1543 | 1572.947 |
| 1544 | 1571.93 |
| 1545 | 1570.915 |
| 1546 | 1569.9 |
| 1547 | 1568.887 |
| 1548 | 1567.876 |
| 1549 | 1566.868 |
| 1550 | 1565.858 |
| 1551 | 1564.85 |
| 1552 | 1563.845 |
| 1553 | 1562.855 |
| 1554 | 1561.852 |
| 1555 | 1560.869 |
| 1556 | 1560.385 |
| 1557 | 1559.385 |
| 1558 | 1558.387 |
| 1559 | 1557.389 |
| 1560 | 1556.392 |
| 1561 | 1555.402 |
| 1562 | 1554.419 |
| 1563 | 1553.427 |
| 1564 | 1552.436 |
| 1565 | 1551.469 |
| 1566 | 1550.481 |
| 1567 | 1549.536 |
| 1568 | 1548.565 |
| 1569 | 1547.647 |
| 1570 | 1546.668 |
| 1571 | 1546.782 |
| 1572 | 1545.799 |
| 1573 | 1544.933 |
| 1574 | 1543.953 |
| 1575 | 1544.059 |
| 1576 | 1543.081 |
| 1577 | 1542.732 |
| 1578 | 1541.767 |
| 1579 | 1540.794 |
| 1580 | 1539.837 |
| 1581 | 1538.865 |
| 1582 | 1537.894 |
| 1583 | 1536.924 |
| 1584 | 1535.961 |
| 1585 | 1535.032 |
| 1586 | 1534.071 |
| 1587 | 1533.106 |
| 1588 | 1532.142 |
| 1589 | 1531.18 |
| 1590 | 1530.265 |
| 1591 | 1529.304 |
| 1592 | 1528.351 |
| 1593 | 1527.406 |
| 1594 | 1526.454 |
| 1595 | 1525.499 |
| 1596 | 1524.545 |
| 1597 | 1523.594 |
| 1598 | 1522.642 |
| 1599 | 1521.718 |
| 1600 | 1520.768 |
| 1601 | 1519.819 |
| 1602 | 1518.873 |
| 1603 | 1517.927 |
| 1604 | 1516.985 |
| 1605 | 1516.045 |
| 1606 | 1515.109 |
| 1607 | 1514.839 |
| 1608 | 1513.904 |
| 1609 | 1512.983 |
| 1610 | 1512.045 |
| 1611 | 1511.108 |
| 1612 | 1510.173 |
| 1613 | 1509.242 |
| 1614 | 1508.313 |
| 1615 | 1507.384 |
| 1616 | 1506.459 |
| 1617 | 1505.53 |
| 1618 | 1504.602 |
| 1619 | 1503.674 |
| 1620 | 1502.747 |
| 1621 | 1501.822 |
| 1622 | 1500.898 |
| 1623 | 1499.974 |
| 1624 | 1499.054 |
| 1625 | 1498.143 |
| 1626 | 1497.223 |
| 1627 | 1496.305 |
| 1628 | 1495.387 |
| 1629 | 1494.471 |
| 1630 | 1493.556 |
| 1631 | 1492.667 |
| 1632 | 1491.755 |
| 1633 | 1490.85 |
| 1634 | 1489.939 |
| 1635 | 1489.029 |
| 1636 | 1488.122 |
| 1637 | 1487.216 |
| 1638 | 1486.31 |
| 1639 | 1485.405 |
| 1640 | 1484.502 |
| 1641 | 1483.599 |
| 1642 | 1482.699 |
| 1643 | 1481.802 |
| 1644 | 1480.902 |
| 1645 | 1480.004 |
| 1646 | 1479.106 |
| 1647 | 1478.21 |
| 1648 | 1477.331 |
| 1649 | 1476.58 |
| 1650 | 1475.687 |
| 1651 | 1474.816 |
| 1652 | 1473.926 |
| 1653 | 1473.038 |
| 1654 | 1472.148 |
| 1655 | 1471.264 |
| 1656 | 1470.398 |
| 1657 | 1469.641 |
| 1658 | 1468.837 |
| 1659 | 1467.953 |
| 1660 | 1467.124 |
| 1661 | 1466.242 |
| 1662 | 1465.362 |
| 1663 | 1464.485 |
| 1664 | 1463.611 |
| 1665 | 1462.743 |
| 1666 | 1461.866 |
| 1667 | 1460.991 |
| 1668 | 1460.116 |
| 1669 | 1459.389 |
| 1670 | 1458.519 |
| 1671 | 1457.653 |
| 1672 | 1456.783 |
| 1673 | 1455.934 |
| 1674 | 1455.068 |
| 1675 | 1454.201 |
| 1676 | 1453.351 |
| 1677 | 1452.487 |
| 1678 | 1451.623 |
| 1679 | 1450.761 |
| 1680 | 1449.906 |
| 1681 | 1449.047 |
| 1682 | 1448.399 |
| 1683 | 1550.887 |
| 1684 | 1549.967 |
| 1685 | 1549.164 |
| 1686 | 1548.409 |
| 1687 | 1547.496 |
| 1688 | 1546.58 |
| 1689 | 1545.668 |
| 1690 | 1544.756 |
| 1691 | 1543.846 |
| 1692 | 1542.935 |
| 1693 | 1542.03 |
| 1694 | 1541.132 |
| 1695 | 1540.224 |
| 1696 | 1539.317 |
| 1697 | 1538.417 |
| 1698 | 1537.513 |
| 1699 | 1536.615 |
| 1700 | 1535.712 |
| 1701 | 1534.813 |
| 1702 | 1533.913 |
| 1703 | 1533.014 |
| 1704 | 1532.116 |
| 1705 | 1531.22 |
| 1706 | 1530.329 |
| 1707 | 1529.445 |
| 1708 | 1528.982 |
| 1709 | 1528.09 |
| 1710 | 1527.217 |
| 1711 | 1526.333 |
| 1712 | 1525.45 |
| 1713 | 1524.574 |
| 1714 | 1523.686 |
| 1715 | 1522.799 |
| 1716 | 1521.913 |
| 1717 | 1521.032 |
| 1718 | 1520.167 |
| 1719 | 1519.287 |
| 1720 | 1518.405 |
| 1721 | 1517.524 |
| 1722 | 1516.644 |
| 1723 | 1516.537 |
| 1724 | 1515.658 |
| 1725 | 1514.781 |
| 1726 | 1513.904 |
| 1727 | 1513.03 |
| 1728 | 1512.155 |
| 1729 | 1511.282 |
| 1730 | 1510.411 |
| 1731 | 1509.571 |
| 1732 | 1508.783 |
| 1733 | 1507.914 |
| 1734 | 1507.046 |
| 1735 | 1506.18 |
| 1736 | 1505.315 |
| 1737 | 1504.453 |
| 1738 | 1503.589 |
| 1739 | 1502.725 |
| 1740 | 1501.873 |
| 1741 | 1501.012 |
| 1742 | 1502.145 |
| 1743 | 1501.286 |
| 1744 | 1500.448 |
| 1745 | 1499.59 |
| 1746 | 1498.734 |
| 1747 | 1497.878 |
| 1748 | 1497.123 |
| 1749 | 1496.268 |
| 1750 | 1495.415 |
| 1751 | 1494.673 |
| 1752 | 1493.824 |
| 1753 | 1492.984 |
| 1754 | 1492.134 |
| 1755 | 1491.595 |
| 1756 | 1490.747 |
| 1757 | 1489.91 |
| 1758 | 1489.064 |
| 1759 | 1488.219 |
| 1760 | 1487.375 |
| 1761 | 1489.905 |
| 1762 | 1489.123 |
| 1763 | 1488.28 |
| 1764 | 1487.441 |
| 1765 | 1486.602 |
| 1766 | 1485.762 |
| 1767 | 1484.925 |
| 1768 | 1484.089 |
| 1769 | 1483.253 |
| 1770 | 1482.418 |
| 1771 | 1481.659 |
| 1772 | 1480.835 |
| 1773 | 1480.001 |
| 1774 | 1479.175 |
| 1775 | 1478.343 |
| 1776 | 1477.516 |
| 1777 | 1476.686 |
| 1778 | 1475.859 |
| 1779 | 1475.233 |
| 1780 | 1474.413 |
| 1781 | 1473.595 |
| 1782 | 1472.769 |
| 1783 | 1471.946 |
| 1784 | 1471.314 |
| 1785 | 1470.497 |
| 1786 | 1469.691 |
| 1787 | 1468.874 |
| 1788 | 1468.054 |
| 1789 | 1467.24 |
| 1790 | 1466.422 |
| 1791 | 1465.61 |
| 1792 | 1464.793 |
| 1793 | 1463.978 |
| 1794 | 1463.201 |
| 1795 | 1462.398 |
| 1796 | 1461.598 |
| 1797 | 1460.786 |
| 1798 | 1459.975 |
| 1799 | 1459.169 |
| 1800 | 1458.36 |
| 1801 | 1457.551 |
| 1802 | 1456.756 |
| 1803 | 1456.13 |
| 1804 | 1455.348 |
| 1805 | 1454.55 |
| 1806 | 1453.747 |
| 1807 | 1452.944 |
| 1808 | 1452.146 |
| 1809 | 1451.346 |
| 1810 | 1450.56 |
| 1811 | 1449.765 |
| 1812 | 1448.971 |
| 1813 | 1448.189 |
| 1814 | 1447.393 |
| 1815 | 1446.603 |
| 1816 | 1445.808 |
| 1817 | 1445.013 |
| 1818 | 1444.228 |
| 1819 | 1443.438 |
| 1820 | 1445.962 |
| 1821 | 1445.17 |
| 1822 | 1444.383 |
| 1823 | 1443.592 |
| 1824 | 1442.802 |
| 1825 | 1442.032 |
| 1826 | 1441.244 |
| 1827 | 1440.46 |
| 1828 | 1439.673 |
| 1829 | 1438.887 |
| 1830 | 1438.103 |
| 1831 | 1437.319 |
| 1832 | 1436.538 |
| 1833 | 1435.756 |
| 1834 | 1435.011 |
| 1835 | 1434.232 |
| 1836 | 1433.452 |
| 1837 | 1432.676 |
| 1838 | 1431.898 |
| 1839 | 1431.128 |
| 1840 | 1430.989 |
| 1841 | 1430.285 |
| 1842 | 1429.511 |
| 1843 | 1428.736 |
| 1844 | 1428.003 |
| 1845 | 1427.324 |
| 1846 | 1426.558 |
| 1847 | 1425.787 |
| 1848 | 1425.019 |
| 1849 | 1424.25 |
| 1850 | 1423.504 |
| 1851 | 1422.745 |
| 1852 | 1422.118 |
| 1853 | 1421.352 |
| 1854 | 1420.594 |
| 1855 | 1419.83 |
| 1856 | 1419.103 |
| 1857 | 1418.48 |
| 1858 | 1417.719 |
| 1859 | 1416.957 |
| 1860 | 1416.197 |
| 1861 | 1415.438 |
| 1862 | 1414.681 |
| 1863 | 1413.934 |
| 1864 | 1413.223 |
| 1865 | 1412.468 |
| 1866 | 1411.712 |
| 1867 | 1410.957 |
| 1868 | 1410.208 |
| 1869 | 1409.454 |
| 1870 | 1408.702 |
| 1871 | 1407.952 |
| 1872 | 1407.214 |
| 1873 | 1406.467 |
| 1874 | 1405.718 |
| 1875 | 1404.969 |
| 1876 | 1404.248 |
| 1877 | 1403.503 |
| 1878 | 1402.792 |
| 1879 | 1402.046 |
| 1880 | 1401.312 |
| 1881 | 1400.575 |
| 1882 | 1399.832 |
| 1883 | 1399.094 |
| 1884 | 1398.354 |
| 1885 | 1397.613 |
| 1886 | 1396.879 |
| 1887 | 1396.14 |
| 1888 | 1395.407 |
| 1889 | 1394.699 |
| 1890 | 1393.962 |
| 1891 | 1393.23 |
| 1892 | 1392.586 |
| 1893 | 1391.853 |
| 1894 | 1391.121 |
| 1895 | 1390.392 |
| 1896 | 1389.666 |
| 1897 | 1388.937 |
| 1898 | 1388.21 |
| 1899 | 1387.481 |
| 1900 | 1386.752 |
| 1901 | 1386.024 |
| 1902 | 1385.296 |
| 1903 | 1384.569 |
| 1904 | 1383.949 |
| 1905 | 1383.224 |
| 1906 | 1382.5 |
| 1907 | 1381.848 |
| 1908 | 1381.125 |
| 1909 | 1380.403 |
| 1910 | 1380.078 |
| 1911 | 1379.357 |
| 1912 | 1378.637 |
| 1913 | 1377.917 |
| 1914 | 1377.2 |
| 1915 | 1376.483 |
| 1916 | 1375.767 |
| 1917 | 1375.051 |
| 1918 | 1374.351 |
| 1919 | 1373.636 |
| 1920 | 1372.927 |
| 1921 | 1372.215 |
| 1922 | 1371.502 |
| 1923 | 1370.791 |
| 1924 | 1370.092 |
| 1925 | 1369.382 |
| 1926 | 1368.674 |
| 1927 | 1367.965 |
| 1928 | 1367.358 |
| 1929 | 1366.651 |
| 1930 | 1365.944 |
| 1931 | 1365.238 |
| 1932 | 1364.534 |
| 1933 | 1364.333 |
| 1934 | 1363.629 |
| 1935 | 1362.958 |
| 1936 | 1362.26 |
| 1937 | 1361.561 |
| 1938 | 1360.874 |
| 1939 | 1360.185 |
| 1940 | 1359.485 |
| 1941 | 1358.791 |
| 1942 | 1358.093 |
| 1943 | 1357.395 |
| 1944 | 1356.701 |
| 1945 | 1356.005 |
| 1946 | 1355.31 |
| 1947 | 1354.615 |
| 1948 | 1353.929 |
| 1949 | 1353.236 |
| 1950 | 1363.247 |
| 1951 | 1362.549 |
| 1952 | 1361.965 |
| 1953 | 1363.428 |
| 1954 | 1362.732 |
| 1955 | 1362.036 |
| 1956 | 1361.341 |
| 1957 | 1360.647 |
| 1958 | 1359.953 |
| 1959 | 1359.26 |
| 1960 | 1358.589 |
| 1961 | 1357.897 |
| 1962 | 1357.211 |
| 1963 | 1356.521 |
| 1964 | 1355.831 |
| 1965 | 1355.213 |
| 1966 | 1354.526 |
| 1967 | 1353.874 |
| 1968 | 1353.229 |
| 1969 | 1352.543 |
| 1970 | 1351.858 |
| 1971 | 1351.183 |
| 1972 | 1350.524 |
| 1973 | 1349.841 |
| 1974 | 1349.162 |
| 1975 | 1348.481 |
| 1976 | 1347.799 |
| 1977 | 1347.121 |
| 1978 | 1346.448 |
| 1979 | 1345.769 |
| 1980 | 1345.095 |
| 1981 | 1344.418 |
| 1982 | 1343.742 |
| 1983 | 1343.065 |
| 1984 | 1342.389 |
| 1985 | 1342.839 |
| 1986 | 1343.125 |
| 1987 | 1342.45 |
| 1988 | 1341.779 |
| 1989 | 1341.106 |
| 1990 | 1340.438 |
| 1991 | 1339.819 |
| 1992 | 1339.154 |
| 1993 | 1338.483 |
| 1994 | 1337.813 |
| 1995 | 1337.145 |
| 1996 | 1336.476 |
| 1997 | 1335.808 |
| 1998 | 1335.14 |
| 1999 | 1334.614 |
| 2000 | 1333.948 |
| 2001 | 1333.283 |
| 2002 | 1332.619 |
| 2003 | 1331.955 |
| 2004 | 1331.312 |
| 2005 | 1330.65 |
| 2006 | 1329.988 |
| 2007 | 1329.326 |
| 2008 | 1328.668 |
| 2009 | 1328.011 |
| 2010 | 1327.352 |
| 2011 | 1326.943 |
| 2012 | 1326.297 |
| 2013 | 1325.645 |
| 2014 | 1325.029 |
| 2015 | 1324.373 |
| 2016 | 1323.717 |
| 2017 | 1323.197 |
| 2018 | 1322.562 |
| 2019 | 1321.91 |
| 2020 | 1321.488 |
| 2021 | 1320.835 |
| 2022 | 1320.184 |
| 2023 | 1319.533 |
| 2024 | 1327.321 |
| 2025 | 1327.493 |
| 2026 | 1326.838 |
| 2027 | 1326.187 |
| 2028 | 1325.534 |
| 2029 | 1324.883 |
| 2030 | 1324.912 |
| 2031 | 1877.853 |
| 2032 | 1876.936 |
| 2033 | 1876.015 |
| 2034 | 1875.094 |
| 2035 | 1874.174 |
| 2036 | 1873.278 |
| 2037 | 1872.377 |
| 2038 | 1871.462 |
| 2039 | 1870.545 |
| 2040 | 1869.63 |
| 2041 | 1869.059 |
| 2042 | 1868.193 |
| 2043 | 1867.31 |
| 2044 | 1866.4 |
| 2045 | 1865.494 |
| 2046 | 1864.584 |
| 2047 | 1863.763 |
| 2048 | 1862.856 |
| 2049 | 1861.949 |
| 2050 | 1861.043 |
| 2051 | 1860.138 |
| 2052 | 1859.39 |
| 2053 | 1858.492 |
| 2054 | 1857.599 |
| 2055 | 1856.696 |
| 2056 | 1855.794 |
| 2057 | 1854.941 |
| 2058 | 1854.041 |
| 2059 | 1853.143 |
| 2060 | 1852.244 |
| 2061 | 1851.349 |
| 2062 | 1850.455 |
| 2063 | 1849.559 |
| 2064 | 1848.665 |
| 2065 | 1847.771 |
| 2066 | 1846.881 |
| 2067 | 1845.992 |
| 2068 | 1845.101 |
| 2069 | 1844.213 |
| 2070 | 1843.323 |
| 2071 | 1842.435 |
| 2072 | 1841.6 |
| 2073 | 1840.713 |
| 2074 | 1839.83 |
| 2075 | 1839.154 |
| 2076 | 1838.28 |
| 2077 | 1837.396 |
| 2078 | 1836.513 |
| 2079 | 1835.631 |
| 2080 | 1834.75 |
| 2081 | 1833.874 |
| 2082 | 1832.995 |
| 2083 | 1832.12 |
| 2084 | 1831.244 |
| 2085 | 1830.367 |
| 2086 | 1829.491 |
| 2087 | 1828.616 |
| 2088 | 1827.741 |
| 2089 | 1826.91 |
| 2090 | 1826.037 |
| 2091 | 1825.165 |
| 2092 | 1824.294 |
| 2093 | 1823.426 |
| 2094 | 1822.58 |
| 2095 | 1822.168 |
| 2096 | 1821.3 |
| 2097 | 1820.433 |
| 2098 | 1819.566 |
| 2099 | 1818.72 |
| 2100 | 1817.964 |
| 2101 | 1817.1 |
| 2102 | 1816.24 |
| 2103 | 1815.377 |
| 2104 | 1814.515 |
| 2105 | 1813.655 |
| 2106 | 1812.795 |
| 2107 | 1811.939 |
| 2108 | 1811.08 |
| 2109 | 1810.223 |
| 2110 | 1809.367 |
| 2111 | 1808.511 |
| 2112 | 1807.656 |
| 2113 | 1807.011 |
| 2114 | 1806.157 |
| 2115 | 1805.307 |
| 2116 | 1804.479 |
| 2117 | 1803.628 |
| 2118 | 1802.783 |
| 2119 | 1801.934 |
| 2120 | 1801.085 |
| 2121 | 1800.237 |
| 2122 | 1799.391 |
| 2123 | 1798.595 |
| 2124 | 1922.807 |
| 2125 | 1921.906 |
| 2126 | 1921.015 |
| 2127 | 1920.116 |
| 2128 | 1919.215 |
| 2129 | 1918.315 |
| 2130 | 1917.424 |
| 2131 | 1916.526 |
| 2132 | 1915.653 |
| 2133 | 1914.756 |
| 2134 | 1913.86 |
| 2135 | 1912.964 |
| 2136 | 1912.092 |
| 2137 | 1911.199 |
| 2138 | 1910.306 |
| 2139 | 1921.116 |
| 2140 | 1920.229 |
| 2141 | 1919.655 |
| 2142 | 1918.763 |
| 2143 | 1917.873 |
| 2144 | 1916.982 |
| 2145 | 1916.102 |
| 2146 | 1915.21 |
| 2147 | 1914.379 |
| 2148 | 1913.505 |
| 2149 | 1912.617 |
| 2150 | 1911.758 |
| 2151 | 1910.87 |
| 2152 | 1909.984 |
| 2153 | 1909.098 |
| 2154 | 1908.213 |
| 2155 | 1907.329 |
| 2156 | 1906.446 |
| 2157 | 1905.566 |
| 2158 | 1904.684 |
| 2159 | 1903.803 |
| 2160 | 1902.964 |
| 2161 | 1902.087 |
| 2162 | 1901.209 |
| 2163 | 1900.343 |
| 2164 | 1901.836 |
| 2165 | 1900.961 |
| 2166 | 1900.087 |
| 2167 | 1899.212 |
| 2168 | 1898.339 |
| 2169 | 1897.504 |
| 2170 | 1896.631 |
| 2171 | 1895.765 |
| 2172 | 1894.896 |
| 2173 | 1894.028 |
| 2174 | 1893.158 |
| 2175 | 1892.289 |
| 2176 | 1891.421 |
| 2177 | 1890.553 |
| 2178 | 1889.69 |
| 2179 | 1893.195 |
| 2180 | 1892.334 |
| 2181 | 1891.469 |
| 2182 | 1890.603 |
| 2183 | 1889.754 |
| 2184 | 1889.028 |
| 2185 | 1888.166 |
| 2186 | 1887.303 |
| 2187 | 1886.441 |
| 2188 | 1885.581 |
| 2189 | 1884.767 |
| 2190 | 1893.66 |
| 2191 | 1892.809 |
| 2192 | 1891.949 |
| 2193 | 1891.709 |
| 2194 | 1890.85 |
| 2195 | 1889.991 |
| 2196 | 1889.131 |
| 2197 | 1888.273 |
| 2198 | 1887.471 |
| 2199 | 1886.614 |
| 2200 | 1885.758 |
| 2201 | 1884.902 |
| 2202 | 1884.049 |
| 2203 | 1883.252 |
| 2204 | 1896.312 |
| 2205 | 1895.454 |
| 2206 | 1894.76 |
| 2207 | 1893.902 |
| 2208 | 1893.104 |
| 2209 | 1892.248 |
| 2210 | 1891.394 |
| 2211 | 1890.541 |
| 2212 | 1889.692 |
| 2213 | 1888.842 |
| 2214 | 1887.991 |
| 2215 | 1887.141 |
| 2216 | 1886.981 |
| 2217 | 1886.133 |
| 2218 | 1885.3 |
| 2219 | 1884.451 |
| 2220 | 1883.604 |
| 2221 | 1882.786 |
| 2222 | 1881.939 |
| 2223 | 1881.094 |
| 2224 | 1880.266 |
| 2225 | 1879.43 |
| 2226 | 1878.589 |
| 2227 | 1877.747 |
| 2228 | 1876.906 |
| 2229 | 1876.067 |
| 2230 | 1875.232 |
| 2231 | 1874.393 |
| 2232 | 1873.554 |
| 2233 | 1872.717 |
| 2234 | 1871.879 |
| 2235 | 1871.054 |
| 2236 | 1870.218 |
| 2237 | 1870.829 |
| 2238 | 1870.022 |
| 2239 | 1879.978 |
| 2240 | 1879.139 |
| 2241 | 1878.302 |
| 2242 | 1877.681 |
| 2243 | 1876.845 |
| 2244 | 1876.01 |
| 2245 | 1875.178 |
| 2246 | 1874.345 |
| 2247 | 1873.522 |
| 2248 | 1872.69 |
| 2249 | 1871.86 |
| 2250 | 1871.03 |
| 2251 | 1870.2 |
| 2252 | 1871.831 |
| 2253 | 1871.002 |
| 2254 | 1870.175 |
| 2255 | 1869.347 |
| 2256 | 1868.52 |
| 2257 | 1867.693 |
| 2258 | 1866.871 |
| 2259 | 1866.046 |
| 2260 | 1865.223 |
| 2261 | 1864.399 |
| 2262 | 1863.579 |
| 2263 | 1862.756 |
| 2264 | 1861.957 |
| 2265 | 1861.136 |
| 2266 | 1860.323 |
| 2267 | 1859.514 |
| 2268 | 1858.698 |
| 2269 | 1857.881 |
| 2270 | 1857.074 |
| 2271 | 1856.259 |
| 2272 | 1855.444 |
| 2273 | 1854.63 |
| 2274 | 1853.817 |
| 2275 | 1853.004 |
| 2276 | 1852.194 |
| 2277 | 1851.419 |
| 2278 | 1850.607 |
| 2279 | 1849.83 |
| 2280 | 1849.027 |
| 2281 | 1848.218 |
| 2282 | 1849.324 |
| 2283 | 1848.518 |
| 2284 | 1847.712 |
| 2285 | 1846.905 |
| 2286 | 1846.099 |
| 2287 | 1845.293 |
| 2288 | 1844.488 |
| 2289 | 1843.684 |
| 2290 | 1842.882 |
| 2291 | 1842.079 |
| 2292 | 1841.277 |
| 2293 | 1840.475 |
| 2294 | 1839.674 |
| 2295 | 1838.874 |
| 2296 | 1838.077 |
| 2297 | 1837.279 |
| 2298 | 1836.496 |
| 2299 | 1835.706 |
| 2300 | 1834.911 |
| 2301 | 1834.115 |
| 2302 | 1833.319 |
| 2303 | 1832.525 |
| 2304 | 1831.733 |
| 2305 | 1830.941 |
| 2306 | 1830.148 |
| 2307 | 1829.355 |
| 2308 | 1828.839 |
| 2309 | 1828.049 |
| 2310 | 1827.259 |
| 2311 | 1826.47 |
| 2312 | 1825.818 |
| 2313 | 1825.034 |
| 2314 | 1824.246 |
| 2315 | 1823.552 |
| 2316 | 1822.766 |
| 2317 | 1822.013 |
| 2318 | 1821.297 |
| 2319 | 1820.513 |
| 2320 | 1819.73 |
| 2321 | 1818.949 |
| 2322 | 1818.174 |
| 2323 | 1817.393 |
| 2324 | 1816.612 |
| 2325 | 1815.849 |
| 2326 | 1815.072 |
| 2327 | 1814.292 |
| 2328 | 1813.52 |
| 2329 | 1812.742 |
| 2330 | 1811.967 |
| 2331 | 1811.192 |
| 2332 | 1810.417 |
| 2333 | 1809.642 |
| 2334 | 1808.868 |
| 2335 | 1808.099 |
| 2336 | 1807.35 |
| 2337 | 1806.618 |
| 2338 | 1805.846 |
| 2339 | 1808.016 |
| 2340 | 1807.245 |
| 2341 | 1806.625 |
| 2342 | 1805.854 |
| 2343 | 1805.085 |
| 2344 | 1804.316 |
| 2345 | 1803.549 |
| 2346 | 1802.783 |
| 2347 | 1802.018 |
| 2348 | 1801.252 |
| 2349 | 1800.487 |
| 2350 | 1799.721 |
| 2351 | 1798.958 |
| 2352 | 1798.195 |
| 2353 | 1797.434 |
| 2354 | 1796.672 |
| 2355 | 1795.915 |
| 2356 | 1795.153 |
| 2357 | 1794.394 |
| 2358 | 1793.635 |
| 2359 | 1792.875 |
| 2360 | 1792.121 |
| 2361 | 1791.424 |
| 2362 | 1790.67 |
| 2363 | 1789.926 |
| 2364 | 1789.171 |
| 2365 | 1788.417 |
| 2366 | 1787.67 |
| 2367 | 1786.919 |
| 2368 | 1786.165 |
| 2369 | 1785.476 |
| 2370 | 1784.723 |
| 2371 | 1783.976 |
| 2372 | 1783.226 |
| 2373 | 1782.482 |
| 2374 | 1781.74 |
| 2375 | 1780.991 |
| 2376 | 1780.243 |
| 2377 | 1779.497 |
| 2378 | 1778.751 |
| 2379 | 1778.031 |
| 2380 | 1777.284 |
| 2381 | 1776.639 |
| 2382 | 1775.894 |
| 2383 | 1775.15 |
| 2384 | 1774.409 |
| 2385 | 1773.666 |
| 2386 | 1772.925 |
| 2387 | 1772.183 |
| 2388 | 1771.444 |
| 2389 | 1770.703 |
| 2390 | 1770.034 |
| 2391 | 1769.295 |
| 2392 | 1768.558 |
| 2393 | 1767.866 |
| 2394 | 1767.322 |
| 2395 | 1766.632 |
| 2396 | 1765.904 |
| 2397 | 1765.17 |
| 2398 | 1764.435 |
| 2399 | 1763.7 |
| 2400 | 1762.987 |
| 2401 | 1762.263 |
| 2402 | 1761.53 |
| 2403 | 1760.81 |
| 2404 | 1760.116 |
| 2405 | 1759.391 |
| 2406 | 1758.661 |
| 2407 | 1757.931 |
| 2408 | 1757.202 |
| 2409 | 1756.527 |
| 2410 | 1755.799 |
| 2411 | 1755.08 |
| 2412 | 1754.354 |
| 2413 | 1753.628 |
| 2414 | 1752.903 |
| 2415 | 1752.241 |
| 2416 | 1751.518 |
| 2417 | 1750.794 |
| 2418 | 1750.343 |
| 2419 | 1749.621 |
| 2420 | 1748.898 |
| 2421 | 1748.178 |
| 2422 | 1747.457 |
| 2423 | 1746.739 |
| 2424 | 1746.053 |
| 2425 | 1745.351 |
| 2426 | 1744.86 |
| 2427 | 1744.157 |
| 2428 | 1743.439 |
| 2429 | 1742.722 |
| 2430 | 1742.021 |
| 2431 | 1741.311 |
| 2432 | 1740.595 |
| 2433 | 1739.913 |
| 2434 | 1739.2 |
| 2435 | 1738.488 |
| 2436 | 1737.776 |
| 2437 | 1737.067 |
| 2438 | 1736.36 |
| 2439 | 1735.652 |
| 2440 | 1734.942 |
| 2441 | 1734.234 |
| 2442 | 1733.526 |
| 2443 | 1732.82 |
| 2444 | 1732.115 |
| 2445 | 1731.411 |
| 2446 | 1730.704 |
| 2447 | 1729.998 |
| 2448 | 1729.295 |
| 2449 | 1728.591 |
| 2450 | 1727.887 |
| 2451 | 1727.184 |
| 2452 | 1726.48 |
| 2453 | 1725.788 |
| 2454 | 1725.085 |
| 2455 | 1724.521 |
| 2456 | 1723.836 |
| 2457 | 1723.146 |
| 2458 | 1722.522 |
| 2459 | 1721.824 |
| 2460 | 1721.127 |
| 2461 | 1755.223 |
| 2462 | 1754.516 |
| 2463 | 1753.804 |
| 2464 | 1753.095 |
| 2465 | 1752.385 |
| 2466 | 1751.707 |
| 2467 | 1750.998 |
| 2468 | 1750.29 |
| 2469 | 1749.583 |
| 2470 | 1748.876 |
| 2471 | 1748.169 |
| 2472 | 1747.463 |
| 2473 | 1746.76 |
| 2474 | 1746.059 |
| 2475 | 1745.488 |
| 2476 | 1744.784 |
| 2477 | 1744.082 |
| 2478 | 1743.379 |
| 2479 | 1742.677 |
| 2480 | 1741.975 |
| 2481 | 1741.284 |
| 2482 | 1740.584 |
| 2483 | 1739.885 |
| 2484 | 1739.192 |
| 2485 | 1738.492 |
| 2486 | 1737.795 |
| 2487 | 1737.097 |
| 2488 | 1736.425 |
| 2489 | 1735.73 |
| 2490 | 1735.034 |
| 2491 | 1734.498 |
| 2492 | 1733.803 |
| 2493 | 1733.109 |
| 2494 | 1732.418 |
| 2495 | 1731.737 |
| 2496 | 1731.044 |
| 2497 | 1730.352 |
| 2498 | 1729.66 |
| 2499 | 1728.969 |
| 2500 | 1728.283 |
| 2501 | 1727.593 |
| 2502 | 1726.909 |
| 2503 | 1726.22 |
| 2504 | 1725.532 |
| 2505 | 1724.877 |
| 2506 | 1724.2 |
| 2507 | 1723.514 |
| 2508 | 1722.842 |
| 2509 | 1723.62 |
| 2510 | 1722.934 |
| 2511 | 1722.25 |
| 2512 | 1721.568 |
| 2513 | 1720.884 |
| 2514 | 1720.201 |
| 2515 | 1719.526 |
| 2516 | 1718.851 |
| 2517 | 1718.169 |
| 2518 | 1717.519 |
| 2519 | 1716.841 |
| 2520 | 1716.163 |
| 2521 | 1715.491 |
| 2522 | 1714.812 |
| 2523 | 1714.133 |
| 2524 | 1713.457 |
| 2525 | 1712.782 |
| 2526 | 1712.18 |
| 2527 | 1711.505 |
| 2528 | 1710.829 |
| 2529 | 1710.154 |
| 2530 | 1709.478 |
| 2531 | 1708.805 |
| 2532 | 1708.131 |
| 2533 | 1707.467 |
| 2534 | 1706.794 |
| 2535 | 1706.123 |
| 2536 | 1705.455 |
| 2537 | 1704.815 |
| 2538 | 1704.145 |
| 2539 | 1703.505 |
| 2540 | 1702.875 |
| 2541 | 1702.205 |
| 2542 | 1701.537 |
| 2543 | 1700.868 |
| 2544 | 1700.21 |
| 2545 | 1699.552 |
| 2546 | 1698.889 |
| 2547 | 1698.228 |
| 2548 | 1697.562 |
| 2549 | 1696.897 |
| 2550 | 1696.239 |
| 2551 | 1695.575 |
| 2552 | 1694.912 |
| 2553 | 1694.28 |
| 2554 | 1693.957 |
| 2555 | 1693.321 |
| 2556 | 1692.66 |
| 2557 | 1692.002 |
| 2558 | 1691.341 |
| 2559 | 1690.682 |
| 2560 | 1696.227 |
| 2561 | 1695.57 |
| 2562 | 1694.909 |
| 2563 | 1694.271 |
| 2564 | 1693.612 |
| 2565 | 1692.958 |
| 2566 | 1692.301 |
| 2567 | 1691.642 |
| 2568 | 1690.984 |
| 2569 | 1690.327 |
| 2570 | 1689.746 |
| 2571 | 1689.091 |
| 2572 | 1688.446 |
| 2573 | 1687.792 |
| 2574 | 1687.164 |
| 2575 | 1686.509 |
| 2576 | 1685.856 |
| 2577 | 1685.204 |
| 2578 | 1686.565 |
| 2579 | 1685.912 |
| 2580 | 1685.259 |
| 2581 | 1684.607 |
| 2582 | 1686.84 |
| 2583 | 1686.189 |
| 2584 | 1685.604 |
| 2585 | 1684.953 |
| 2586 | 1684.304 |
| 2587 | 1683.669 |
| 2588 | 1683.02 |
| 2589 | 1682.378 |
| 2590 | 1681.73 |
| 2591 | 1681.083 |
| 2592 | 1680.459 |
| 2593 | 1679.814 |
| 2594 | 1679.203 |
| 2595 | 1678.557 |
| 2596 | 1677.911 |
| 2597 | 1677.269 |
| 2598 | 1676.625 |
| 2599 | 1675.982 |
| 2600 | 1675.338 |
| 2601 | 1674.697 |
| 2602 | 1674.103 |
| 2603 | 1950.359 |
| 2604 | 1949.611 |
| 2605 | 1948.865 |
| 2606 | 1948.124 |
| 2607 | 1947.377 |
| 2608 | 1946.632 |
| 2609 | 1945.889 |
| 2610 | 1945.145 |
| 2611 | 1944.407 |
| 2612 | 1943.667 |
| 2613 | 1942.925 |
| 2614 | 1942.187 |
| 2615 | 1941.463 |
| 2616 | 1940.773 |
| 2617 | 1940.033 |
| 2618 | 1939.293 |
| 2619 | 1938.555 |
| 2620 | 1937.816 |
| 2621 | 1937.104 |
| 2622 | 1936.54 |
| 2623 | 1935.813 |
| 2624 | 1935.076 |
| 2625 | 1934.345 |
| 2626 | 1933.609 |
| 2627 | 1932.882 |
| 2628 | 1932.173 |
| 2629 | 1931.439 |
| 2630 | 1930.706 |
| 2631 | 1929.988 |
| 2632 | 1929.275 |
| 2633 | 1928.545 |
| 2634 | 1927.823 |
| 2635 | 1927.093 |
| 2636 | 1926.364 |
| 2637 | 1931.278 |
| 2638 | 1930.578 |
| 2639 | 1929.847 |
| 2640 | 1929.125 |
| 2641 | 1928.398 |
| 2642 | 1927.674 |
| 2643 | 1926.948 |
| 2644 | 1926.223 |
| 2645 | 1925.496 |
| 2646 | 1924.77 |
| 2647 | 1924.056 |
| 2648 | 1923.331 |
| 2649 | 1922.605 |
| 2650 | 1921.887 |
| 2651 | 1921.165 |
| 2652 | 1920.448 |
| 2653 | 1919.75 |
| 2654 | 1919.031 |
| 2655 | 1918.313 |
| 2656 | 1917.592 |
| 2657 | 1916.871 |
| 2658 | 1916.151 |
| 2659 | 1915.461 |
| 2660 | 1914.742 |
| 2661 | 1914.023 |
| 2662 | 1913.327 |
| 2663 | 1912.61 |
| 2664 | 1911.894 |
| 2665 | 1911.179 |
| 2666 | 1910.463 |
| 2667 | 1909.748 |
| 2668 | 1909.033 |
| 2669 | 1908.319 |
| 2670 | 1907.606 |
| 2671 | 1906.927 |
| 2672 | 1906.219 |
| 2673 | 1905.519 |
| 2674 | 1904.808 |
| 2675 | 1904.099 |
| 2676 | 1903.493 |
| 2677 | 1902.783 |
| 2678 | 1902.073 |
| 2679 | 1901.363 |
| 2680 | 1900.655 |
| 2681 | 1900.088 |
| 2682 | 1899.381 |
| 2683 | 1898.681 |
| 2684 | 1897.974 |
| 2685 | 1897.268 |
| 2686 | 1896.565 |
| 2687 | 1895.86 |
| 2688 | 1895.162 |
| 2689 | 1894.459 |
| 2690 | 1893.808 |
| 2691 | 1893.105 |
| 2692 | 1892.402 |
| 2693 | 1891.834 |
| 2694 | 1891.134 |
| 2695 | 1890.433 |
| 2696 | 1889.733 |
| 2697 | 1889.035 |
| 2698 | 1888.336 |
| 2699 | 1887.638 |
| 2700 | 1886.945 |
| 2701 | 1887.098 |
| 2702 | 1886.401 |
| 2703 | 1885.704 |
| 2704 | 1885.013 |
| 2705 | 1884.317 |
| 2706 | 1883.622 |
| 2707 | 1882.944 |
| 2708 | 1882.249 |
| 2709 | 1881.597 |
| 2710 | 1880.903 |
| 2711 | 1880.212 |
| 2712 | 1879.521 |
| 2713 | 1878.829 |
| 2714 | 1878.138 |
| 2715 | 1877.447 |
| 2716 | 1876.757 |
| 2717 | 1877.115 |
| 2718 | 1876.426 |
| 2719 | 1875.737 |
| 2720 | 1875.051 |
| 2721 | 1874.368 |
| 2722 | 1885.137 |
| 2723 | 1884.445 |
| 2724 | 1883.754 |
| 2725 | 1883.067 |
| 2726 | 1882.377 |
| 2727 | 1881.688 |
| 2728 | 1881.005 |
| 2729 | 1880.317 |
| 2730 | 1879.632 |
| 2731 | 1878.948 |
| 2732 | 1878.265 |
| 2733 | 1877.579 |
| 2734 | 1876.905 |
| 2735 | 1876.225 |
| 2736 | 1875.561 |
| 2737 | 1874.876 |
| 2738 | 1874.193 |
| 2739 | 1873.509 |
| 2740 | 1872.83 |
| 2741 | 1872.153 |
| 2742 | 1871.473 |
| 2743 | 1870.794 |
| 2744 | 1870.114 |
| 2745 | 1869.439 |
| 2746 | 1868.76 |
| 2747 | 1868.119 |
| 2748 | 1867.44 |
| 2749 | 1866.979 |
| 2750 | 1866.312 |
| 2751 | 1865.634 |
| 2752 | 1865.067 |
| 2753 | 1864.39 |
| 2754 | 1863.714 |
| 2755 | 1863.039 |
| 2756 | 1862.364 |
| 2757 | 1861.69 |
| 2758 | 1861.035 |
| 2759 | 1860.362 |
| 2760 | 1859.702 |
| 2761 | 1860.576 |
| 2762 | 1859.903 |
| 2763 | 1859.231 |
| 2764 | 1858.559 |
| 2765 | 1857.889 |
| 2766 | 1857.22 |
| 2767 | 1856.55 |
| 2768 | 1855.904 |
| 2769 | 1855.238 |
| 2770 | 1854.58 |
| 2771 | 1853.911 |
| 2772 | 1853.245 |
| 2773 | 1852.598 |
| 2774 | 1851.932 |
| 2775 | 1851.265 |
| 2776 | 1850.6 |
| 2777 | 1849.934 |
| 2778 | 1849.27 |
| 2779 | 1848.611 |
| 2780 | 1847.947 |
| 2781 | 1847.289 |
| 2782 | 1846.63 |
| 2783 | 1845.968 |
| 2784 | 1845.305 |
| 2785 | 1845.328 |
| 2786 | 1844.667 |
| 2787 | 1844.006 |
| 2788 | 1843.346 |
| 2789 | 1842.686 |
| 2790 | 1842.026 |
| 2791 | 1841.367 |
| 2792 | 1840.715 |
| 2793 | 1840.058 |
| 2794 | 1839.403 |
| 2795 | 1838.781 |
| 2796 | 1838.124 |
| 2797 | 1838.799 |
| 2798 | 1838.143 |
| 2799 | 1837.487 |
| 2800 | 1836.835 |
| 2801 | 1836.183 |
| 2802 | 1835.533 |
| 2803 | 1834.944 |
| 2804 | 1834.291 |
| 2805 | 1833.638 |
| 2806 | 1832.987 |
| 2807 | 1832.335 |
| 2808 | 1831.683 |
| 2809 | 1831.032 |
| 2810 | 1830.381 |
| 2811 | 1829.731 |
| 2812 | 1829.081 |
| 2813 | 1828.541 |
| 2814 | 1827.893 |
| 2815 | 1827.244 |
| 2816 | 1826.596 |
| 2817 | 1825.95 |
| 2818 | 1825.319 |
| 2819 | 1824.673 |
| 2820 | 1824.026 |
| 2821 | 1823.383 |
| 2822 | 1822.994 |
| 2823 | 1822.35 |
| 2824 | 1821.705 |
| 2825 | 1821.067 |
| 2826 | 1820.425 |
| 2827 | 1819.781 |
| 2828 | 1819.202 |
| 2829 | 1818.563 |
| 2830 | 1818.001 |
| 2831 | 1817.36 |
| 2832 | 1817.211 |
| 2833 | 1816.571 |
| 2834 | 1815.952 |
| 2835 | 1852.785 |
| 2836 | 1852.133 |
| 2837 | 1851.48 |
| 2838 | 1850.829 |
| 2839 | 1850.598 |
| 2840 | 1849.947 |
| 2841 | 1849.297 |
| 2842 | 1848.648 |
| 2843 | 1848.008 |
| 2844 | 1847.359 |
| 2845 | 1846.712 |
| 2846 | 1846.068 |
| 2847 | 1845.421 |
| 2848 | 1844.774 |
| 2849 | 1844.128 |
| 2850 | 1843.482 |
| 2851 | 1842.868 |
| 2852 | 1842.299 |
| 2853 | 1841.654 |
| 2854 | 1841.01 |
| 2855 | 1840.366 |
| 2856 | 1839.724 |
| 2857 | 1839.081 |
| 2858 | 1838.443 |
| 2859 | 1837.802 |
| 2860 | 1837.161 |
| 2861 | 1836.52 |
| 2862 | 1835.882 |
| 2863 | 1835.241 |
| 2864 | 1834.602 |
| 2865 | 1833.962 |
| 2866 | 1833.325 |
| 2867 | 1832.97 |
| 2868 | 1832.332 |
| 2869 | 1831.695 |
| 2870 | 1831.058 |
| 2871 | 1830.44 |
| 2872 | 1830.503 |
| 2873 | 1829.867 |
| 2874 | 1829.274 |
| 2875 | 1828.64 |
| 2876 | 1828.005 |
| 2877 | 1827.377 |
| 2878 | 1826.778 |
| 2879 | 1826.144 |
| 2880 | 1825.511 |
| 2881 | 1824.88 |
| 2882 | 1824.251 |
| 2883 | 1823.644 |
| 2884 | 1823.014 |
| 2885 | 1822.383 |
| 2886 | 1821.778 |
| 2887 | 1821.153 |
| 2888 | 1820.524 |
| 2889 | 1820.682 |
| 2890 | 1820.053 |
| 2891 | 1819.468 |
| 2892 | 1818.842 |
| 2893 | 1818.215 |
| 2894 | 1817.589 |
| 2895 | 1816.962 |
| 2896 | 1816.342 |
| 2897 | 1815.716 |
| 2898 | 1815.09 |
| 2899 | 1814.465 |
| 2900 | 1813.842 |
| 2901 | 1813.218 |
| 2902 | 1812.598 |
| 2903 | 1812.313 |
| 2904 | 1811.694 |
| 2905 | 1811.078 |
| 2906 | 1810.456 |
| 2907 | 1809.835 |
| 2908 | 1809.214 |
| 2909 | 1808.594 |
| 2910 | 1807.974 |
| 2911 | 1807.353 |
| 2912 | 1806.734 |
| 2913 | 1806.115 |
| 2914 | 1805.496 |
| 2915 | 1804.88 |
| 2916 | 1804.472 |
| 2917 | 1803.856 |
| 2918 | 1803.239 |
| 2919 | 1802.628 |
| 2920 | 1802.011 |
| 2921 | 1801.396 |
| 2922 | 1800.781 |
| 2923 | 1800.166 |
| 2924 | 1800.117 |
| 2925 | 1799.503 |
| 2926 | 1798.902 |
| 2927 | 1798.481 |
| 2928 | 1797.869 |
| 2929 | 1798.236 |
| 2930 | 1797.625 |
| 2931 | 1797.015 |
| 2932 | 1796.403 |
| 2933 | 1795.798 |
| 2934 | 1795.187 |
| 2935 | 1794.577 |
| 2936 | 1793.98 |
| 2937 | 1793.382 |
| 2938 | 1792.774 |
| 2939 | 1792.169 |
| 2940 | 1791.654 |
| 2941 | 1791.048 |
| 2942 | 1790.44 |
| 2943 | 1789.897 |
| 2944 | 1789.29 |
| 2945 | 1788.685 |
| 2946 | 1788.083 |
| 2947 | 1787.477 |
| 2948 | 1786.872 |
| 2949 | 1786.266 |
| 2950 | 1785.663 |
| 2951 | 1785.115 |
| 2952 | 1784.512 |
| 2953 | 1783.908 |
| 2954 | 1783.306 |
| 2955 | 1782.703 |
| 2956 | 1782.112 |
| 2957 | 1781.509 |
| 2958 | 1780.908 |
| 2959 | 1780.316 |
| 2960 | 1779.717 |
| 2961 | 1779.182 |
| 2962 | 1778.582 |
| 2963 | 1777.989 |
| 2964 | 1777.39 |
| 2965 | 1776.792 |
| 2966 | 1776.198 |
| 2967 | 1775.6 |
| 2968 | 1775.003 |
| 2969 | 1774.406 |
| 2970 | 1773.809 |
| 2971 | 1773.213 |
| 2972 | 1772.618 |
| 2973 | 1772.044 |
| 2974 | 1771.453 |
| 2975 | 1770.866 |
| 2976 | 1770.272 |
| 2977 | 1769.678 |
| 2978 | 1769.085 |
| 2979 | 1770.699 |
| 2980 | 1770.107 |
| 2981 | 1769.514 |
| 2982 | 1768.926 |
| 2983 | 1768.343 |
| 2984 | 1767.756 |
| 2985 | 1767.164 |
| 2986 | 1766.574 |
| 2987 | 1765.983 |
| 2988 | 1765.393 |
| 2989 | 1766.016 |
| 2990 | 1765.426 |
| 2991 | 1766.161 |
| 2992 | 1765.657 |
| 2993 | 1765.068 |
| 2994 | 1764.48 |
| 2995 | 1763.891 |
| 2996 | 1763.303 |
| 2997 | 1762.716 |
| 2998 | 1762.134 |
| 2999 | 1761.549 |
| 3000 | 1760.962 |
| 3001 | 1760.513 |
| 3002 | 1759.928 |
| 3003 | 1759.718 |
| 3004 | 1759.134 |
| 3005 | 1758.549 |
| 3006 | 1758.304 |
| 3007 | 1757.72 |
| 3008 | 1757.136 |
| 3009 | 1764.348 |
| 3010 | 1763.762 |
| 3011 | 1763.181 |
| 3012 | 1762.596 |
| 3013 | 1762.188 |
| 3014 | 1761.604 |
| 3015 | 1761.02 |
| 3016 | 1760.437 |
| 3017 | 1759.861 |
| 3018 | 1759.279 |
| 3019 | 1758.697 |
| 3020 | 1758.116 |
| 3021 | 1757.536 |
| 3022 | 1756.955 |
| 3023 | 1756.375 |
| 3024 | 1755.937 |
| 3025 | 1755.36 |
| 3026 | 1754.781 |
| 3027 | 1754.204 |
| 3028 | 1753.626 |
| 3029 | 1753.047 |
| 3030 | 1752.473 |
| 3031 | 1751.896 |
| 3032 | 1751.319 |
| 3033 | 1750.758 |
| 3034 | 1750.182 |
| 3035 | 1749.608 |
| 3036 | 1749.032 |
| 3037 | 1748.459 |
| 3038 | 1747.885 |
| 3039 | 1747.311 |
| 3040 | 1746.736 |
| 3041 | 1746.164 |
| 3042 | 1745.591 |
| 3043 | 1745.062 |
| 3044 | 1744.489 |
| 3045 | 1743.92 |
| 3046 | 1743.348 |
| 3047 | 1742.779 |
| 3048 | 1742.208 |
| 3049 | 1741.915 |
| 3050 | 1741.344 |
| 3051 | 1740.774 |
| 3052 | 1740.207 |
| 3053 | 1739.638 |
| 3054 | 1739.07 |
| 3055 | 1738.502 |
| 3056 | 1737.983 |
| 3057 | 1737.415 |
| 3058 | 1737.423 |
| 3059 | 1736.856 |
| 3060 | 1736.291 |
| 3061 | 1735.724 |
| 3062 | 1735.174 |
| 3063 | 1734.615 |
| 3064 | 1734.052 |
| 3065 | 1733.489 |
| 3066 | 1732.93 |
| 3067 | 1732.367 |
| 3068 | 1731.803 |
| 3069 | 1731.239 |
| 3070 | 1730.688 |
| 3071 | 1730.125 |
| 3072 | 1729.563 |
| 3073 | 1729 |
| 3074 | 1728.439 |
| 3075 | 1727.877 |
| 3076 | 1727.319 |
| 3077 | 1726.76 |
| 3078 | 1726.226 |
| 3079 | 1725.704 |
| 3080 | 1725.144 |
| 3081 | 1724.592 |
| 3082 | 1724.034 |
| 3083 | 1723.476 |
| 3084 | 1722.935 |
| 3085 | 1722.378 |
| 3086 | 1721.821 |
| 3087 | 1721.264 |
| 3088 | 1720.707 |
| 3089 | 1720.187 |
| 3090 | 1719.631 |
| 3091 | 1719.075 |
| 3092 | 1718.578 |
| 3093 | 1718.029 |
| 3094 | 1717.474 |
| 3095 | 1716.92 |
| 3096 | 1716.369 |
| 3097 | 1715.835 |
| 3098 | 1715.283 |
| 3099 | 1714.731 |
| 3100 | 1714.178 |
| 3101 | 1713.634 |
| 3102 | 1713.085 |
| 3103 | 1712.535 |
| 3104 | 1711.984 |
| 3105 | 1711.435 |
| 3106 | 1710.886 |
| 3107 | 1710.353 |
| 3108 | 1709.805 |
| 3109 | 1709.256 |
| 3110 | 1708.707 |
| 3111 | 1708.172 |
| 3112 | 1707.627 |
| 3113 | 1707.08 |
| 3114 | 1706.533 |
| 3115 | 1705.991 |
| 3116 | 1705.444 |
| 3117 | 1704.898 |
| 3118 | 1704.352 |
| 3119 | 1703.807 |
| 3120 | 1703.286 |
| 3121 | 1702.742 |
| 3122 | 1702.197 |
| 3123 | 1701.654 |
| 3124 | 1701.111 |
| 3125 | 1700.567 |
| 3126 | 1700.025 |
| 3127 | 1699.484 |
| 3128 | 1698.989 |
| 3129 | 1698.446 |
| 3130 | 1697.906 |
| 3131 | 1697.373 |
| 3132 | 1696.832 |
| 3133 | 1696.29 |
| 3134 | 1695.751 |
| 3135 | 1695.212 |
| 3136 | 1694.672 |
| 3137 | 1694.269 |
| 3138 | 1693.73 |
| 3139 | 1693.225 |
| 3140 | 1692.686 |
| 3141 | 1692.149 |
| 3142 | 1691.612 |
| 3143 | 1691.09 |
| 3144 | 1690.555 |
| 3145 | 1690.037 |
| 3146 | 1689.501 |
| 3147 | 1688.969 |
| 3148 | 1688.502 |
| 3149 | 1687.968 |
| 3150 | 1687.433 |
| 3151 | 1686.898 |
| 3152 | 1686.365 |
| 3153 | 1685.831 |
| 3154 | 1685.299 |
| 3155 | 1684.792 |
| 3156 | 1684.259 |
| 3157 | 1683.726 |
| 3158 | 1683.193 |
| 3159 | 1682.665 |
| 3160 | 1682.133 |
| 3161 | 1681.603 |
| 3162 | 1681.072 |
| 3163 | 1680.557 |
| 3164 | 1680.29 |
| 3165 | 1679.76 |
| 3166 | 1679.231 |
| 3167 | 1678.701 |
| 3168 | 1678.172 |
| 3169 | 1677.643 |
| 3170 | 1677.114 |
| 3171 | 1676.586 |
| 3172 | 1676.06 |
| 3173 | 1675.561 |
| 3174 | 1675.05 |
| 3175 | 1674.524 |
| 3176 | 1678.652 |
| 3177 | 1678.124 |
| 3178 | 1677.597 |
| 3179 | 1677.071 |
| 3180 | 1676.546 |
| 3181 | 1676.021 |
| 3182 | 1675.495 |
| 3183 | 1674.97 |
| 3184 | 1674.446 |
| 3185 | 1673.921 |
| 3186 | 1675.231 |
| 3187 | 1674.708 |
| 3188 | 1674.184 |
| 3189 | 1673.66 |
| 3190 | 1673.28 |
| 3191 | 1672.757 |
| 3192 | 1672.234 |
| 3193 | 1671.712 |
| 3194 | 1671.189 |
| 3195 | 1670.667 |
| 3196 | 1670.149 |
| 3197 | 1669.631 |
| 3198 | 1669.113 |
| 3199 | 1668.592 |
| 3200 | 1668.076 |
| 3201 | 1667.557 |
| 3202 | 1667.037 |
| 3203 | 1666.546 |
| 3204 | 1666.032 |
| 3205 | 1665.513 |
| 3206 | 1664.995 |
| 3207 | 1664.486 |
| 3208 | 1663.968 |
| 3209 | 1663.452 |
| 3210 | 1662.934 |
| 3211 | 1662.418 |
| 3212 | 1661.901 |
| 3213 | 1661.386 |
| 3214 | 1660.869 |
| 3215 | 1660.353 |
| 3216 | 1659.841 |
| 3217 | 1659.326 |
| 3218 | 1658.811 |
| 3219 | 1658.331 |
| 3220 | 1657.857 |
| 3221 | 1657.346 |
| 3222 | 1656.833 |
| 3223 | 1656.329 |
| 3224 | 1655.815 |
| 3225 | 1655.303 |
| 3226 | 1654.792 |
| 3227 | 1654.28 |
| 3228 | 1653.774 |
| 3229 | 1653.273 |
| 3230 | 1652.763 |
| 3231 | 1652.252 |
| 3232 | 1651.744 |
| 3233 | 1651.233 |
| 3234 | 1650.723 |
| 3235 | 1650.214 |
| 3236 | 1649.707 |
| 3237 | 1649.197 |
| 3238 | 1648.691 |
| 3239 | 1648.206 |
| 3240 | 1647.706 |
| 3241 | 1647.199 |
| 3242 | 1646.692 |
| 3243 | 1646.185 |
| 3244 | 1645.678 |
| 3245 | 1645.173 |
| 3246 | 1644.668 |
| 3247 | 1644.162 |
| 3248 | 1643.695 |
| 3249 | 1643.189 |
| 3250 | 1642.685 |
| 3251 | 1642.184 |
| 3252 | 1641.679 |
| 3253 | 1641.196 |
| 3254 | 1640.693 |
| 3255 | 1640.189 |
| 3256 | 1639.689 |
| 3257 | 1639.186 |
| 3258 | 1638.688 |
| 3259 | 1638.186 |
| 3260 | 1637.684 |
| 3261 | 1637.184 |
| 3262 | 1636.714 |
| 3263 | 1636.212 |
| 3264 | 1635.712 |
| 3265 | 1635.212 |
| 3266 | 1634.711 |
| 3267 | 1634.212 |
| 3268 | 1633.717 |
| 3269 | 1633.22 |
| 3270 | 1632.721 |
| 3271 | 1632.227 |
| 3272 | 1631.73 |
| 3273 | 1631.235 |
| 3274 | 1630.741 |
| 3275 | 1630.246 |
| 3276 | 1629.762 |
| 3277 | 1753.176 |
| 3278 | 1752.645 |
| 3279 | 1752.118 |
| 3280 | 1751.747 |
| 3281 | 1751.214 |
| 3282 | 1750.684 |
| 3283 | 1750.158 |
| 3284 | 1749.631 |
| 3285 | 1749.099 |
| 3286 | 1748.567 |
| 3287 | 1748.049 |
| 3288 | 1747.519 |
| 3289 | 1746.988 |
| 3290 | 1746.458 |
| 3291 | 1745.982 |
| 3292 | 1745.452 |
| 3293 | 1744.923 |
| 3294 | 1744.393 |
| 3295 | 1743.865 |
| 3296 | 1743.338 |
| 3297 | 1742.817 |
| 3298 | 1742.302 |
| 3299 | 1741.775 |
| 3300 | 1741.257 |
| 3301 | 1740.731 |
| 3302 | 1740.207 |
| 3303 | 1739.681 |
| 3304 | 1739.156 |
| 3305 | 1738.63 |
| 3306 | 1738.111 |
| 3307 | 1737.586 |
| 3308 | 1737.063 |
| 3309 | 1736.543 |
| 3310 | 1736.022 |
| 3311 | 1735.502 |
| 3312 | 1734.979 |
| 3313 | 1734.69 |
| 3314 | 1734.17 |
| 3315 | 1733.649 |
| 3316 | 1733.128 |
| 3317 | 1732.606 |
| 3318 | 1732.087 |
| 3319 | 1731.566 |
| 3320 | 1731.09 |
| 3321 | 1730.589 |
| 3322 | 1730.068 |
| 3323 | 1730.332 |
| 3324 | 1729.812 |
| 3325 | 1729.305 |
| 3326 | 1728.786 |